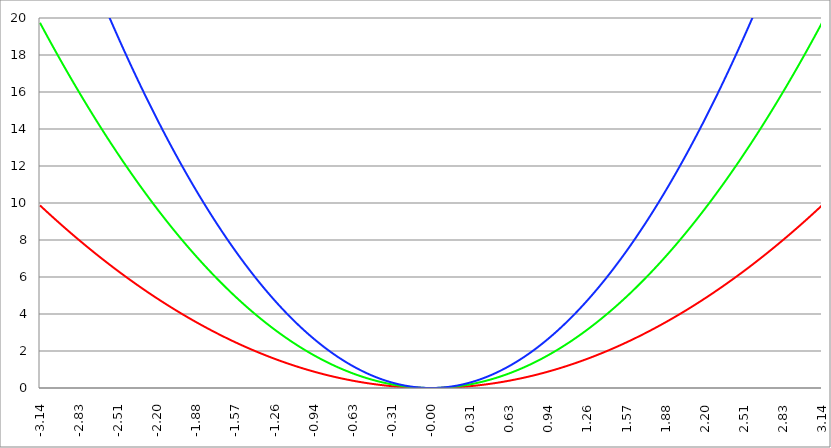
| Category | Series 1 | Series 0 | Series 2 |
|---|---|---|---|
| -3.141592653589793 | 9.87 | 19.739 | 29.609 |
| -3.138451060936204 | 9.85 | 19.7 | 29.55 |
| -3.135309468282614 | 9.83 | 19.66 | 29.49 |
| -3.132167875629024 | 9.81 | 19.621 | 29.431 |
| -3.129026282975434 | 9.791 | 19.582 | 29.372 |
| -3.125884690321845 | 9.771 | 19.542 | 29.313 |
| -3.122743097668256 | 9.752 | 19.503 | 29.255 |
| -3.119601505014666 | 9.732 | 19.464 | 29.196 |
| -3.116459912361076 | 9.712 | 19.425 | 29.137 |
| -3.113318319707487 | 9.693 | 19.386 | 29.078 |
| -3.110176727053897 | 9.673 | 19.346 | 29.02 |
| -3.107035134400308 | 9.654 | 19.307 | 28.961 |
| -3.103893541746717 | 9.634 | 19.268 | 28.902 |
| -3.100751949093128 | 9.615 | 19.229 | 28.844 |
| -3.097610356439539 | 9.595 | 19.19 | 28.786 |
| -3.094468763785949 | 9.576 | 19.151 | 28.727 |
| -3.09132717113236 | 9.556 | 19.113 | 28.669 |
| -3.08818557847877 | 9.537 | 19.074 | 28.611 |
| -3.08504398582518 | 9.517 | 19.035 | 28.552 |
| -3.081902393171591 | 9.498 | 18.996 | 28.494 |
| -3.078760800518001 | 9.479 | 18.958 | 28.436 |
| -3.075619207864412 | 9.459 | 18.919 | 28.378 |
| -3.072477615210822 | 9.44 | 18.88 | 28.32 |
| -3.069336022557232 | 9.421 | 18.842 | 28.262 |
| -3.066194429903643 | 9.402 | 18.803 | 28.205 |
| -3.063052837250053 | 9.382 | 18.765 | 28.147 |
| -3.059911244596463 | 9.363 | 18.726 | 28.089 |
| -3.056769651942874 | 9.344 | 18.688 | 28.032 |
| -3.053628059289284 | 9.325 | 18.649 | 27.974 |
| -3.050486466635695 | 9.305 | 18.611 | 27.916 |
| -3.047344873982105 | 9.286 | 18.573 | 27.859 |
| -3.044203281328516 | 9.267 | 18.534 | 27.802 |
| -3.041061688674926 | 9.248 | 18.496 | 27.744 |
| -3.037920096021336 | 9.229 | 18.458 | 27.687 |
| -3.034778503367747 | 9.21 | 18.42 | 27.63 |
| -3.031636910714157 | 9.191 | 18.382 | 27.572 |
| -3.028495318060568 | 9.172 | 18.344 | 27.515 |
| -3.025353725406978 | 9.153 | 18.306 | 27.458 |
| -3.022212132753388 | 9.134 | 18.268 | 27.401 |
| -3.019070540099799 | 9.115 | 18.23 | 27.344 |
| -3.015928947446209 | 9.096 | 18.192 | 27.287 |
| -3.01278735479262 | 9.077 | 18.154 | 27.231 |
| -3.00964576213903 | 9.058 | 18.116 | 27.174 |
| -3.00650416948544 | 9.039 | 18.078 | 27.117 |
| -3.003362576831851 | 9.02 | 18.04 | 27.061 |
| -3.000220984178261 | 9.001 | 18.003 | 27.004 |
| -2.997079391524672 | 8.982 | 17.965 | 26.947 |
| -2.993937798871082 | 8.964 | 17.927 | 26.891 |
| -2.990796206217492 | 8.945 | 17.89 | 26.835 |
| -2.987654613563903 | 8.926 | 17.852 | 26.778 |
| -2.984513020910313 | 8.907 | 17.815 | 26.722 |
| -2.981371428256724 | 8.889 | 17.777 | 26.666 |
| -2.978229835603134 | 8.87 | 17.74 | 26.61 |
| -2.975088242949544 | 8.851 | 17.702 | 26.553 |
| -2.971946650295955 | 8.832 | 17.665 | 26.497 |
| -2.968805057642365 | 8.814 | 17.628 | 26.441 |
| -2.965663464988776 | 8.795 | 17.59 | 26.385 |
| -2.962521872335186 | 8.777 | 17.553 | 26.33 |
| -2.959380279681596 | 8.758 | 17.516 | 26.274 |
| -2.956238687028007 | 8.739 | 17.479 | 26.218 |
| -2.953097094374417 | 8.721 | 17.442 | 26.162 |
| -2.949955501720828 | 8.702 | 17.404 | 26.107 |
| -2.946813909067238 | 8.684 | 17.367 | 26.051 |
| -2.943672316413648 | 8.665 | 17.33 | 25.996 |
| -2.940530723760059 | 8.647 | 17.293 | 25.94 |
| -2.937389131106469 | 8.628 | 17.257 | 25.885 |
| -2.93424753845288 | 8.61 | 17.22 | 25.829 |
| -2.93110594579929 | 8.591 | 17.183 | 25.774 |
| -2.9279643531457 | 8.573 | 17.146 | 25.719 |
| -2.924822760492111 | 8.555 | 17.109 | 25.664 |
| -2.921681167838521 | 8.536 | 17.072 | 25.609 |
| -2.918539575184932 | 8.518 | 17.036 | 25.554 |
| -2.915397982531342 | 8.5 | 16.999 | 25.499 |
| -2.912256389877752 | 8.481 | 16.962 | 25.444 |
| -2.909114797224163 | 8.463 | 16.926 | 25.389 |
| -2.905973204570573 | 8.445 | 16.889 | 25.334 |
| -2.902831611916984 | 8.426 | 16.853 | 25.279 |
| -2.899690019263394 | 8.408 | 16.816 | 25.225 |
| -2.896548426609804 | 8.39 | 16.78 | 25.17 |
| -2.893406833956215 | 8.372 | 16.744 | 25.115 |
| -2.890265241302625 | 8.354 | 16.707 | 25.061 |
| -2.887123648649035 | 8.335 | 16.671 | 25.006 |
| -2.883982055995446 | 8.317 | 16.635 | 24.952 |
| -2.880840463341856 | 8.299 | 16.598 | 24.898 |
| -2.877698870688267 | 8.281 | 16.562 | 24.843 |
| -2.874557278034677 | 8.263 | 16.526 | 24.789 |
| -2.871415685381088 | 8.245 | 16.49 | 24.735 |
| -2.868274092727498 | 8.227 | 16.454 | 24.681 |
| -2.865132500073908 | 8.209 | 16.418 | 24.627 |
| -2.861990907420319 | 8.191 | 16.382 | 24.573 |
| -2.858849314766729 | 8.173 | 16.346 | 24.519 |
| -2.85570772211314 | 8.155 | 16.31 | 24.465 |
| -2.85256612945955 | 8.137 | 16.274 | 24.411 |
| -2.84942453680596 | 8.119 | 16.238 | 24.358 |
| -2.846282944152371 | 8.101 | 16.203 | 24.304 |
| -2.843141351498781 | 8.083 | 16.167 | 24.25 |
| -2.839999758845192 | 8.066 | 16.131 | 24.197 |
| -2.836858166191602 | 8.048 | 16.096 | 24.143 |
| -2.833716573538012 | 8.03 | 16.06 | 24.09 |
| -2.830574980884423 | 8.012 | 16.024 | 24.036 |
| -2.827433388230833 | 7.994 | 15.989 | 23.983 |
| -2.824291795577244 | 7.977 | 15.953 | 23.93 |
| -2.821150202923654 | 7.959 | 15.918 | 23.877 |
| -2.818008610270065 | 7.941 | 15.882 | 23.824 |
| -2.814867017616475 | 7.923 | 15.847 | 23.77 |
| -2.811725424962885 | 7.906 | 15.812 | 23.717 |
| -2.808583832309296 | 7.888 | 15.776 | 23.664 |
| -2.805442239655706 | 7.871 | 15.741 | 23.612 |
| -2.802300647002116 | 7.853 | 15.706 | 23.559 |
| -2.799159054348527 | 7.835 | 15.671 | 23.506 |
| -2.796017461694937 | 7.818 | 15.635 | 23.453 |
| -2.792875869041348 | 7.8 | 15.6 | 23.4 |
| -2.789734276387758 | 7.783 | 15.565 | 23.348 |
| -2.786592683734168 | 7.765 | 15.53 | 23.295 |
| -2.783451091080579 | 7.748 | 15.495 | 23.243 |
| -2.78030949842699 | 7.73 | 15.46 | 23.19 |
| -2.7771679057734 | 7.713 | 15.425 | 23.138 |
| -2.77402631311981 | 7.695 | 15.39 | 23.086 |
| -2.770884720466221 | 7.678 | 15.356 | 23.033 |
| -2.767743127812631 | 7.66 | 15.321 | 22.981 |
| -2.764601535159041 | 7.643 | 15.286 | 22.929 |
| -2.761459942505452 | 7.626 | 15.251 | 22.877 |
| -2.758318349851862 | 7.608 | 15.217 | 22.825 |
| -2.755176757198272 | 7.591 | 15.182 | 22.773 |
| -2.752035164544683 | 7.574 | 15.147 | 22.721 |
| -2.748893571891093 | 7.556 | 15.113 | 22.669 |
| -2.745751979237504 | 7.539 | 15.078 | 22.617 |
| -2.742610386583914 | 7.522 | 15.044 | 22.566 |
| -2.739468793930325 | 7.505 | 15.009 | 22.514 |
| -2.736327201276735 | 7.487 | 14.975 | 22.462 |
| -2.733185608623145 | 7.47 | 14.941 | 22.411 |
| -2.730044015969556 | 7.453 | 14.906 | 22.359 |
| -2.726902423315966 | 7.436 | 14.872 | 22.308 |
| -2.723760830662376 | 7.419 | 14.838 | 22.257 |
| -2.720619238008787 | 7.402 | 14.804 | 22.205 |
| -2.717477645355197 | 7.385 | 14.769 | 22.154 |
| -2.714336052701607 | 7.368 | 14.735 | 22.103 |
| -2.711194460048018 | 7.351 | 14.701 | 22.052 |
| -2.708052867394429 | 7.334 | 14.667 | 22.001 |
| -2.704911274740839 | 7.317 | 14.633 | 21.95 |
| -2.701769682087249 | 7.3 | 14.599 | 21.899 |
| -2.69862808943366 | 7.283 | 14.565 | 21.848 |
| -2.69548649678007 | 7.266 | 14.531 | 21.797 |
| -2.692344904126481 | 7.249 | 14.497 | 21.746 |
| -2.689203311472891 | 7.232 | 14.464 | 21.695 |
| -2.686061718819301 | 7.215 | 14.43 | 21.645 |
| -2.682920126165712 | 7.198 | 14.396 | 21.594 |
| -2.679778533512122 | 7.181 | 14.362 | 21.544 |
| -2.676636940858533 | 7.164 | 14.329 | 21.493 |
| -2.673495348204943 | 7.148 | 14.295 | 21.443 |
| -2.670353755551353 | 7.131 | 14.262 | 21.392 |
| -2.667212162897764 | 7.114 | 14.228 | 21.342 |
| -2.664070570244174 | 7.097 | 14.195 | 21.292 |
| -2.660928977590585 | 7.081 | 14.161 | 21.242 |
| -2.657787384936995 | 7.064 | 14.128 | 21.192 |
| -2.654645792283405 | 7.047 | 14.094 | 21.141 |
| -2.651504199629816 | 7.03 | 14.061 | 21.091 |
| -2.648362606976226 | 7.014 | 14.028 | 21.041 |
| -2.645221014322636 | 6.997 | 13.994 | 20.992 |
| -2.642079421669047 | 6.981 | 13.961 | 20.942 |
| -2.638937829015457 | 6.964 | 13.928 | 20.892 |
| -2.635796236361868 | 6.947 | 13.895 | 20.842 |
| -2.632654643708278 | 6.931 | 13.862 | 20.793 |
| -2.629513051054689 | 6.914 | 13.829 | 20.743 |
| -2.626371458401099 | 6.898 | 13.796 | 20.693 |
| -2.62322986574751 | 6.881 | 13.763 | 20.644 |
| -2.62008827309392 | 6.865 | 13.73 | 20.595 |
| -2.61694668044033 | 6.848 | 13.697 | 20.545 |
| -2.613805087786741 | 6.832 | 13.664 | 20.496 |
| -2.610663495133151 | 6.816 | 13.631 | 20.447 |
| -2.607521902479561 | 6.799 | 13.598 | 20.398 |
| -2.604380309825972 | 6.783 | 13.566 | 20.348 |
| -2.601238717172382 | 6.766 | 13.533 | 20.299 |
| -2.598097124518793 | 6.75 | 13.5 | 20.25 |
| -2.594955531865203 | 6.734 | 13.468 | 20.201 |
| -2.591813939211613 | 6.717 | 13.435 | 20.152 |
| -2.588672346558024 | 6.701 | 13.402 | 20.104 |
| -2.585530753904434 | 6.685 | 13.37 | 20.055 |
| -2.582389161250845 | 6.669 | 13.337 | 20.006 |
| -2.579247568597255 | 6.653 | 13.305 | 19.958 |
| -2.576105975943666 | 6.636 | 13.273 | 19.909 |
| -2.572964383290076 | 6.62 | 13.24 | 19.86 |
| -2.569822790636486 | 6.604 | 13.208 | 19.812 |
| -2.566681197982897 | 6.588 | 13.176 | 19.764 |
| -2.563539605329307 | 6.572 | 13.143 | 19.715 |
| -2.560398012675717 | 6.556 | 13.111 | 19.667 |
| -2.557256420022128 | 6.54 | 13.079 | 19.619 |
| -2.554114827368538 | 6.524 | 13.047 | 19.571 |
| -2.550973234714949 | 6.507 | 13.015 | 19.522 |
| -2.54783164206136 | 6.491 | 12.983 | 19.474 |
| -2.54469004940777 | 6.475 | 12.951 | 19.426 |
| -2.54154845675418 | 6.459 | 12.919 | 19.378 |
| -2.53840686410059 | 6.444 | 12.887 | 19.331 |
| -2.535265271447001 | 6.428 | 12.855 | 19.283 |
| -2.532123678793411 | 6.412 | 12.823 | 19.235 |
| -2.528982086139822 | 6.396 | 12.792 | 19.187 |
| -2.525840493486232 | 6.38 | 12.76 | 19.14 |
| -2.522698900832642 | 6.364 | 12.728 | 19.092 |
| -2.519557308179053 | 6.348 | 12.696 | 19.045 |
| -2.516415715525463 | 6.332 | 12.665 | 18.997 |
| -2.513274122871874 | 6.317 | 12.633 | 18.95 |
| -2.510132530218284 | 6.301 | 12.602 | 18.902 |
| -2.506990937564694 | 6.285 | 12.57 | 18.855 |
| -2.503849344911105 | 6.269 | 12.539 | 18.808 |
| -2.500707752257515 | 6.254 | 12.507 | 18.761 |
| -2.497566159603926 | 6.238 | 12.476 | 18.714 |
| -2.494424566950336 | 6.222 | 12.444 | 18.666 |
| -2.491282974296746 | 6.206 | 12.413 | 18.619 |
| -2.488141381643157 | 6.191 | 12.382 | 18.573 |
| -2.484999788989567 | 6.175 | 12.35 | 18.526 |
| -2.481858196335978 | 6.16 | 12.319 | 18.479 |
| -2.478716603682388 | 6.144 | 12.288 | 18.432 |
| -2.475575011028798 | 6.128 | 12.257 | 18.385 |
| -2.472433418375209 | 6.113 | 12.226 | 18.339 |
| -2.46929182572162 | 6.097 | 12.195 | 18.292 |
| -2.46615023306803 | 6.082 | 12.164 | 18.246 |
| -2.46300864041444 | 6.066 | 12.133 | 18.199 |
| -2.45986704776085 | 6.051 | 12.102 | 18.153 |
| -2.456725455107261 | 6.035 | 12.071 | 18.106 |
| -2.453583862453671 | 6.02 | 12.04 | 18.06 |
| -2.450442269800082 | 6.005 | 12.009 | 18.014 |
| -2.447300677146492 | 5.989 | 11.979 | 17.968 |
| -2.444159084492902 | 5.974 | 11.948 | 17.922 |
| -2.441017491839313 | 5.959 | 11.917 | 17.876 |
| -2.437875899185723 | 5.943 | 11.886 | 17.83 |
| -2.434734306532133 | 5.928 | 11.856 | 17.784 |
| -2.431592713878544 | 5.913 | 11.825 | 17.738 |
| -2.428451121224954 | 5.897 | 11.795 | 17.692 |
| -2.425309528571365 | 5.882 | 11.764 | 17.646 |
| -2.422167935917775 | 5.867 | 11.734 | 17.601 |
| -2.419026343264186 | 5.852 | 11.703 | 17.555 |
| -2.415884750610596 | 5.836 | 11.673 | 17.509 |
| -2.412743157957006 | 5.821 | 11.643 | 17.464 |
| -2.409601565303417 | 5.806 | 11.612 | 17.419 |
| -2.406459972649827 | 5.791 | 11.582 | 17.373 |
| -2.403318379996238 | 5.776 | 11.552 | 17.328 |
| -2.400176787342648 | 5.761 | 11.522 | 17.283 |
| -2.397035194689058 | 5.746 | 11.492 | 17.237 |
| -2.393893602035469 | 5.731 | 11.461 | 17.192 |
| -2.390752009381879 | 5.716 | 11.431 | 17.147 |
| -2.38761041672829 | 5.701 | 11.401 | 17.102 |
| -2.3844688240747 | 5.686 | 11.371 | 17.057 |
| -2.38132723142111 | 5.671 | 11.341 | 17.012 |
| -2.378185638767521 | 5.656 | 11.312 | 16.967 |
| -2.375044046113931 | 5.641 | 11.282 | 16.923 |
| -2.371902453460342 | 5.626 | 11.252 | 16.878 |
| -2.368760860806752 | 5.611 | 11.222 | 16.833 |
| -2.365619268153162 | 5.596 | 11.192 | 16.788 |
| -2.362477675499573 | 5.581 | 11.163 | 16.744 |
| -2.359336082845983 | 5.566 | 11.133 | 16.699 |
| -2.356194490192394 | 5.552 | 11.103 | 16.655 |
| -2.353052897538804 | 5.537 | 11.074 | 16.611 |
| -2.349911304885214 | 5.522 | 11.044 | 16.566 |
| -2.346769712231625 | 5.507 | 11.015 | 16.522 |
| -2.343628119578035 | 5.493 | 10.985 | 16.478 |
| -2.340486526924446 | 5.478 | 10.956 | 16.434 |
| -2.337344934270856 | 5.463 | 10.926 | 16.39 |
| -2.334203341617266 | 5.449 | 10.897 | 16.346 |
| -2.331061748963677 | 5.434 | 10.868 | 16.302 |
| -2.327920156310087 | 5.419 | 10.838 | 16.258 |
| -2.324778563656498 | 5.405 | 10.809 | 16.214 |
| -2.321636971002908 | 5.39 | 10.78 | 16.17 |
| -2.318495378349318 | 5.375 | 10.751 | 16.126 |
| -2.315353785695729 | 5.361 | 10.722 | 16.083 |
| -2.312212193042139 | 5.346 | 10.693 | 16.039 |
| -2.30907060038855 | 5.332 | 10.664 | 15.995 |
| -2.30592900773496 | 5.317 | 10.635 | 15.952 |
| -2.30278741508137 | 5.303 | 10.606 | 15.908 |
| -2.299645822427781 | 5.288 | 10.577 | 15.865 |
| -2.296504229774191 | 5.274 | 10.548 | 15.822 |
| -2.293362637120602 | 5.26 | 10.519 | 15.779 |
| -2.290221044467012 | 5.245 | 10.49 | 15.735 |
| -2.287079451813422 | 5.231 | 10.461 | 15.692 |
| -2.283937859159832 | 5.216 | 10.433 | 15.649 |
| -2.280796266506243 | 5.202 | 10.404 | 15.606 |
| -2.277654673852654 | 5.188 | 10.375 | 15.563 |
| -2.274513081199064 | 5.173 | 10.347 | 15.52 |
| -2.271371488545474 | 5.159 | 10.318 | 15.477 |
| -2.268229895891885 | 5.145 | 10.29 | 15.435 |
| -2.265088303238295 | 5.131 | 10.261 | 15.392 |
| -2.261946710584706 | 5.116 | 10.233 | 15.349 |
| -2.258805117931116 | 5.102 | 10.204 | 15.307 |
| -2.255663525277527 | 5.088 | 10.176 | 15.264 |
| -2.252521932623937 | 5.074 | 10.148 | 15.222 |
| -2.249380339970347 | 5.06 | 10.119 | 15.179 |
| -2.246238747316757 | 5.046 | 10.091 | 15.137 |
| -2.243097154663168 | 5.031 | 10.063 | 15.094 |
| -2.239955562009579 | 5.017 | 10.035 | 15.052 |
| -2.236813969355989 | 5.003 | 10.007 | 15.01 |
| -2.2336723767024 | 4.989 | 9.979 | 14.968 |
| -2.23053078404881 | 4.975 | 9.951 | 14.926 |
| -2.22738919139522 | 4.961 | 9.923 | 14.884 |
| -2.22424759874163 | 4.947 | 9.895 | 14.842 |
| -2.221106006088041 | 4.933 | 9.867 | 14.8 |
| -2.217964413434451 | 4.919 | 9.839 | 14.758 |
| -2.214822820780862 | 4.905 | 9.811 | 14.716 |
| -2.211681228127272 | 4.892 | 9.783 | 14.675 |
| -2.208539635473683 | 4.878 | 9.755 | 14.633 |
| -2.205398042820092 | 4.864 | 9.728 | 14.591 |
| -2.202256450166503 | 4.85 | 9.7 | 14.55 |
| -2.199114857512913 | 4.836 | 9.672 | 14.508 |
| -2.195973264859324 | 4.822 | 9.645 | 14.467 |
| -2.192831672205735 | 4.809 | 9.617 | 14.426 |
| -2.189690079552145 | 4.795 | 9.589 | 14.384 |
| -2.186548486898555 | 4.781 | 9.562 | 14.343 |
| -2.183406894244966 | 4.767 | 9.535 | 14.302 |
| -2.180265301591376 | 4.754 | 9.507 | 14.261 |
| -2.177123708937786 | 4.74 | 9.48 | 14.22 |
| -2.173982116284197 | 4.726 | 9.452 | 14.179 |
| -2.170840523630607 | 4.713 | 9.425 | 14.138 |
| -2.167698930977018 | 4.699 | 9.398 | 14.097 |
| -2.164557338323428 | 4.685 | 9.371 | 14.056 |
| -2.161415745669839 | 4.672 | 9.343 | 14.015 |
| -2.158274153016249 | 4.658 | 9.316 | 13.974 |
| -2.15513256036266 | 4.645 | 9.289 | 13.934 |
| -2.15199096770907 | 4.631 | 9.262 | 13.893 |
| -2.14884937505548 | 4.618 | 9.235 | 13.853 |
| -2.14570778240189 | 4.604 | 9.208 | 13.812 |
| -2.142566189748301 | 4.591 | 9.181 | 13.772 |
| -2.139424597094711 | 4.577 | 9.154 | 13.731 |
| -2.136283004441122 | 4.564 | 9.127 | 13.691 |
| -2.133141411787532 | 4.55 | 9.101 | 13.651 |
| -2.129999819133943 | 4.537 | 9.074 | 13.611 |
| -2.126858226480353 | 4.524 | 9.047 | 13.571 |
| -2.123716633826763 | 4.51 | 9.02 | 13.531 |
| -2.120575041173174 | 4.497 | 8.994 | 13.491 |
| -2.117433448519584 | 4.484 | 8.967 | 13.451 |
| -2.114291855865994 | 4.47 | 8.94 | 13.411 |
| -2.111150263212405 | 4.457 | 8.914 | 13.371 |
| -2.108008670558815 | 4.444 | 8.887 | 13.331 |
| -2.104867077905226 | 4.43 | 8.861 | 13.291 |
| -2.101725485251636 | 4.417 | 8.835 | 13.252 |
| -2.098583892598047 | 4.404 | 8.808 | 13.212 |
| -2.095442299944457 | 4.391 | 8.782 | 13.173 |
| -2.092300707290867 | 4.378 | 8.755 | 13.133 |
| -2.089159114637278 | 4.365 | 8.729 | 13.094 |
| -2.086017521983688 | 4.351 | 8.703 | 13.054 |
| -2.082875929330099 | 4.338 | 8.677 | 13.015 |
| -2.07973433667651 | 4.325 | 8.651 | 12.976 |
| -2.07659274402292 | 4.312 | 8.624 | 12.937 |
| -2.07345115136933 | 4.299 | 8.598 | 12.898 |
| -2.07030955871574 | 4.286 | 8.572 | 12.859 |
| -2.06716796606215 | 4.273 | 8.546 | 12.82 |
| -2.064026373408561 | 4.26 | 8.52 | 12.781 |
| -2.060884780754971 | 4.247 | 8.494 | 12.742 |
| -2.057743188101382 | 4.234 | 8.469 | 12.703 |
| -2.054601595447792 | 4.221 | 8.443 | 12.664 |
| -2.051460002794203 | 4.208 | 8.417 | 12.625 |
| -2.048318410140613 | 4.196 | 8.391 | 12.587 |
| -2.045176817487023 | 4.183 | 8.365 | 12.548 |
| -2.042035224833434 | 4.17 | 8.34 | 12.51 |
| -2.038893632179844 | 4.157 | 8.314 | 12.471 |
| -2.035752039526255 | 4.144 | 8.289 | 12.433 |
| -2.032610446872665 | 4.132 | 8.263 | 12.395 |
| -2.029468854219076 | 4.119 | 8.237 | 12.356 |
| -2.026327261565486 | 4.106 | 8.212 | 12.318 |
| -2.023185668911896 | 4.093 | 8.187 | 12.28 |
| -2.020044076258307 | 4.081 | 8.161 | 12.242 |
| -2.016902483604717 | 4.068 | 8.136 | 12.204 |
| -2.013760890951128 | 4.055 | 8.11 | 12.166 |
| -2.010619298297538 | 4.043 | 8.085 | 12.128 |
| -2.007477705643948 | 4.03 | 8.06 | 12.09 |
| -2.004336112990358 | 4.017 | 8.035 | 12.052 |
| -2.00119452033677 | 4.005 | 8.01 | 12.014 |
| -1.99805292768318 | 3.992 | 7.984 | 11.977 |
| -1.994911335029589 | 3.98 | 7.959 | 11.939 |
| -1.991769742376 | 3.967 | 7.934 | 11.901 |
| -1.98862814972241 | 3.955 | 7.909 | 11.864 |
| -1.98548655706882 | 3.942 | 7.884 | 11.826 |
| -1.98234496441523 | 3.93 | 7.859 | 11.789 |
| -1.97920337176164 | 3.917 | 7.834 | 11.752 |
| -1.976061779108051 | 3.905 | 7.81 | 11.714 |
| -1.972920186454461 | 3.892 | 7.785 | 11.677 |
| -1.969778593800871 | 3.88 | 7.76 | 11.64 |
| -1.966637001147281 | 3.868 | 7.735 | 11.603 |
| -1.963495408493691 | 3.855 | 7.711 | 11.566 |
| -1.960353815840101 | 3.843 | 7.686 | 11.529 |
| -1.957212223186512 | 3.831 | 7.661 | 11.492 |
| -1.954070630532922 | 3.818 | 7.637 | 11.455 |
| -1.950929037879332 | 3.806 | 7.612 | 11.418 |
| -1.947787445225742 | 3.794 | 7.588 | 11.382 |
| -1.944645852572152 | 3.782 | 7.563 | 11.345 |
| -1.941504259918563 | 3.769 | 7.539 | 11.308 |
| -1.938362667264973 | 3.757 | 7.514 | 11.272 |
| -1.935221074611383 | 3.745 | 7.49 | 11.235 |
| -1.932079481957793 | 3.733 | 7.466 | 11.199 |
| -1.928937889304203 | 3.721 | 7.442 | 11.162 |
| -1.925796296650613 | 3.709 | 7.417 | 11.126 |
| -1.922654703997024 | 3.697 | 7.393 | 11.09 |
| -1.919513111343434 | 3.685 | 7.369 | 11.054 |
| -1.916371518689844 | 3.672 | 7.345 | 11.017 |
| -1.913229926036254 | 3.66 | 7.321 | 10.981 |
| -1.910088333382664 | 3.648 | 7.297 | 10.945 |
| -1.906946740729075 | 3.636 | 7.273 | 10.909 |
| -1.903805148075485 | 3.624 | 7.249 | 10.873 |
| -1.900663555421895 | 3.613 | 7.225 | 10.838 |
| -1.897521962768305 | 3.601 | 7.201 | 10.802 |
| -1.894380370114715 | 3.589 | 7.177 | 10.766 |
| -1.891238777461125 | 3.577 | 7.154 | 10.73 |
| -1.888097184807536 | 3.565 | 7.13 | 10.695 |
| -1.884955592153946 | 3.553 | 7.106 | 10.659 |
| -1.881813999500356 | 3.541 | 7.082 | 10.624 |
| -1.878672406846766 | 3.529 | 7.059 | 10.588 |
| -1.875530814193176 | 3.518 | 7.035 | 10.553 |
| -1.872389221539586 | 3.506 | 7.012 | 10.518 |
| -1.869247628885997 | 3.494 | 6.988 | 10.482 |
| -1.866106036232407 | 3.482 | 6.965 | 10.447 |
| -1.862964443578817 | 3.471 | 6.941 | 10.412 |
| -1.859822850925227 | 3.459 | 6.918 | 10.377 |
| -1.856681258271637 | 3.447 | 6.895 | 10.342 |
| -1.853539665618048 | 3.436 | 6.871 | 10.307 |
| -1.850398072964458 | 3.424 | 6.848 | 10.272 |
| -1.847256480310868 | 3.412 | 6.825 | 10.237 |
| -1.844114887657278 | 3.401 | 6.802 | 10.202 |
| -1.840973295003688 | 3.389 | 6.778 | 10.168 |
| -1.837831702350098 | 3.378 | 6.755 | 10.133 |
| -1.834690109696509 | 3.366 | 6.732 | 10.098 |
| -1.831548517042919 | 3.355 | 6.709 | 10.064 |
| -1.82840692438933 | 3.343 | 6.686 | 10.029 |
| -1.82526533173574 | 3.332 | 6.663 | 9.995 |
| -1.822123739082149 | 3.32 | 6.64 | 9.96 |
| -1.81898214642856 | 3.309 | 6.617 | 9.926 |
| -1.81584055377497 | 3.297 | 6.595 | 9.892 |
| -1.81269896112138 | 3.286 | 6.572 | 9.858 |
| -1.80955736846779 | 3.274 | 6.549 | 9.823 |
| -1.8064157758142 | 3.263 | 6.526 | 9.789 |
| -1.80327418316061 | 3.252 | 6.504 | 9.755 |
| -1.800132590507021 | 3.24 | 6.481 | 9.721 |
| -1.796990997853431 | 3.229 | 6.458 | 9.688 |
| -1.793849405199841 | 3.218 | 6.436 | 9.654 |
| -1.790707812546251 | 3.207 | 6.413 | 9.62 |
| -1.787566219892661 | 3.195 | 6.391 | 9.586 |
| -1.784424627239071 | 3.184 | 6.368 | 9.553 |
| -1.781283034585482 | 3.173 | 6.346 | 9.519 |
| -1.778141441931892 | 3.162 | 6.324 | 9.485 |
| -1.774999849278302 | 3.151 | 6.301 | 9.452 |
| -1.771858256624712 | 3.139 | 6.279 | 9.418 |
| -1.768716663971122 | 3.128 | 6.257 | 9.385 |
| -1.765575071317533 | 3.117 | 6.235 | 9.352 |
| -1.762433478663943 | 3.106 | 6.212 | 9.319 |
| -1.759291886010353 | 3.095 | 6.19 | 9.285 |
| -1.756150293356763 | 3.084 | 6.168 | 9.252 |
| -1.753008700703173 | 3.073 | 6.146 | 9.219 |
| -1.749867108049583 | 3.062 | 6.124 | 9.186 |
| -1.746725515395994 | 3.051 | 6.102 | 9.153 |
| -1.743583922742404 | 3.04 | 6.08 | 9.12 |
| -1.740442330088814 | 3.029 | 6.058 | 9.087 |
| -1.737300737435224 | 3.018 | 6.036 | 9.055 |
| -1.734159144781634 | 3.007 | 6.015 | 9.022 |
| -1.731017552128045 | 2.996 | 5.993 | 8.989 |
| -1.727875959474455 | 2.986 | 5.971 | 8.957 |
| -1.724734366820865 | 2.975 | 5.949 | 8.924 |
| -1.721592774167275 | 2.964 | 5.928 | 8.892 |
| -1.718451181513685 | 2.953 | 5.906 | 8.859 |
| -1.715309588860095 | 2.942 | 5.885 | 8.827 |
| -1.712167996206506 | 2.932 | 5.863 | 8.795 |
| -1.709026403552916 | 2.921 | 5.842 | 8.762 |
| -1.705884810899326 | 2.91 | 5.82 | 8.73 |
| -1.702743218245736 | 2.899 | 5.799 | 8.698 |
| -1.699601625592146 | 2.889 | 5.777 | 8.666 |
| -1.696460032938557 | 2.878 | 5.756 | 8.634 |
| -1.693318440284967 | 2.867 | 5.735 | 8.602 |
| -1.690176847631377 | 2.857 | 5.713 | 8.57 |
| -1.687035254977787 | 2.846 | 5.692 | 8.538 |
| -1.683893662324197 | 2.835 | 5.671 | 8.506 |
| -1.680752069670607 | 2.825 | 5.65 | 8.475 |
| -1.677610477017018 | 2.814 | 5.629 | 8.443 |
| -1.674468884363428 | 2.804 | 5.608 | 8.412 |
| -1.671327291709838 | 2.793 | 5.587 | 8.38 |
| -1.668185699056248 | 2.783 | 5.566 | 8.349 |
| -1.665044106402658 | 2.772 | 5.545 | 8.317 |
| -1.661902513749069 | 2.762 | 5.524 | 8.286 |
| -1.658760921095479 | 2.751 | 5.503 | 8.254 |
| -1.655619328441889 | 2.741 | 5.482 | 8.223 |
| -1.6524777357883 | 2.731 | 5.461 | 8.192 |
| -1.649336143134709 | 2.72 | 5.441 | 8.161 |
| -1.646194550481119 | 2.71 | 5.42 | 8.13 |
| -1.64305295782753 | 2.7 | 5.399 | 8.099 |
| -1.63991136517394 | 2.689 | 5.379 | 8.068 |
| -1.63676977252035 | 2.679 | 5.358 | 8.037 |
| -1.63362817986676 | 2.669 | 5.337 | 8.006 |
| -1.63048658721317 | 2.658 | 5.317 | 7.975 |
| -1.62734499455958 | 2.648 | 5.297 | 7.945 |
| -1.624203401905991 | 2.638 | 5.276 | 7.914 |
| -1.621061809252401 | 2.628 | 5.256 | 7.884 |
| -1.617920216598811 | 2.618 | 5.235 | 7.853 |
| -1.614778623945221 | 2.608 | 5.215 | 7.823 |
| -1.611637031291631 | 2.597 | 5.195 | 7.792 |
| -1.608495438638042 | 2.587 | 5.175 | 7.762 |
| -1.605353845984452 | 2.577 | 5.154 | 7.731 |
| -1.602212253330862 | 2.567 | 5.134 | 7.701 |
| -1.599070660677272 | 2.557 | 5.114 | 7.671 |
| -1.595929068023682 | 2.547 | 5.094 | 7.641 |
| -1.592787475370093 | 2.537 | 5.074 | 7.611 |
| -1.589645882716503 | 2.527 | 5.054 | 7.581 |
| -1.586504290062913 | 2.517 | 5.034 | 7.551 |
| -1.583362697409323 | 2.507 | 5.014 | 7.521 |
| -1.580221104755733 | 2.497 | 4.994 | 7.491 |
| -1.577079512102143 | 2.487 | 4.974 | 7.462 |
| -1.573937919448554 | 2.477 | 4.955 | 7.432 |
| -1.570796326794964 | 2.467 | 4.935 | 7.402 |
| -1.567654734141374 | 2.458 | 4.915 | 7.373 |
| -1.564513141487784 | 2.448 | 4.895 | 7.343 |
| -1.561371548834194 | 2.438 | 4.876 | 7.314 |
| -1.558229956180605 | 2.428 | 4.856 | 7.284 |
| -1.555088363527015 | 2.418 | 4.837 | 7.255 |
| -1.551946770873425 | 2.409 | 4.817 | 7.226 |
| -1.548805178219835 | 2.399 | 4.798 | 7.196 |
| -1.545663585566245 | 2.389 | 4.778 | 7.167 |
| -1.542521992912655 | 2.379 | 4.759 | 7.138 |
| -1.539380400259066 | 2.37 | 4.739 | 7.109 |
| -1.536238807605476 | 2.36 | 4.72 | 7.08 |
| -1.533097214951886 | 2.35 | 4.701 | 7.051 |
| -1.529955622298296 | 2.341 | 4.682 | 7.022 |
| -1.526814029644706 | 2.331 | 4.662 | 6.993 |
| -1.523672436991117 | 2.322 | 4.643 | 6.965 |
| -1.520530844337527 | 2.312 | 4.624 | 6.936 |
| -1.517389251683937 | 2.302 | 4.605 | 6.907 |
| -1.514247659030347 | 2.293 | 4.586 | 6.879 |
| -1.511106066376757 | 2.283 | 4.567 | 6.85 |
| -1.507964473723167 | 2.274 | 4.548 | 6.822 |
| -1.504822881069578 | 2.264 | 4.529 | 6.793 |
| -1.501681288415988 | 2.255 | 4.51 | 6.765 |
| -1.498539695762398 | 2.246 | 4.491 | 6.737 |
| -1.495398103108808 | 2.236 | 4.472 | 6.709 |
| -1.492256510455218 | 2.227 | 4.454 | 6.68 |
| -1.489114917801628 | 2.217 | 4.435 | 6.652 |
| -1.485973325148039 | 2.208 | 4.416 | 6.624 |
| -1.482831732494449 | 2.199 | 4.398 | 6.596 |
| -1.47969013984086 | 2.189 | 4.379 | 6.568 |
| -1.476548547187269 | 2.18 | 4.36 | 6.541 |
| -1.473406954533679 | 2.171 | 4.342 | 6.513 |
| -1.47026536188009 | 2.162 | 4.323 | 6.485 |
| -1.4671237692265 | 2.152 | 4.305 | 6.457 |
| -1.46398217657291 | 2.143 | 4.286 | 6.43 |
| -1.46084058391932 | 2.134 | 4.268 | 6.402 |
| -1.45769899126573 | 2.125 | 4.25 | 6.375 |
| -1.45455739861214 | 2.116 | 4.231 | 6.347 |
| -1.451415805958551 | 2.107 | 4.213 | 6.32 |
| -1.448274213304961 | 2.097 | 4.195 | 6.292 |
| -1.445132620651371 | 2.088 | 4.177 | 6.265 |
| -1.441991027997781 | 2.079 | 4.159 | 6.238 |
| -1.438849435344191 | 2.07 | 4.141 | 6.211 |
| -1.435707842690602 | 2.061 | 4.123 | 6.184 |
| -1.432566250037012 | 2.052 | 4.104 | 6.157 |
| -1.429424657383422 | 2.043 | 4.087 | 6.13 |
| -1.426283064729832 | 2.034 | 4.069 | 6.103 |
| -1.423141472076242 | 2.025 | 4.051 | 6.076 |
| -1.419999879422652 | 2.016 | 4.033 | 6.049 |
| -1.416858286769063 | 2.007 | 4.015 | 6.022 |
| -1.413716694115473 | 1.999 | 3.997 | 5.996 |
| -1.410575101461883 | 1.99 | 3.979 | 5.969 |
| -1.407433508808293 | 1.981 | 3.962 | 5.943 |
| -1.404291916154703 | 1.972 | 3.944 | 5.916 |
| -1.401150323501114 | 1.963 | 3.926 | 5.89 |
| -1.398008730847524 | 1.954 | 3.909 | 5.863 |
| -1.394867138193934 | 1.946 | 3.891 | 5.837 |
| -1.391725545540344 | 1.937 | 3.874 | 5.811 |
| -1.388583952886754 | 1.928 | 3.856 | 5.784 |
| -1.385442360233164 | 1.919 | 3.839 | 5.758 |
| -1.382300767579575 | 1.911 | 3.822 | 5.732 |
| -1.379159174925985 | 1.902 | 3.804 | 5.706 |
| -1.376017582272395 | 1.893 | 3.787 | 5.68 |
| -1.372875989618805 | 1.885 | 3.77 | 5.654 |
| -1.369734396965215 | 1.876 | 3.752 | 5.629 |
| -1.366592804311625 | 1.868 | 3.735 | 5.603 |
| -1.363451211658036 | 1.859 | 3.718 | 5.577 |
| -1.360309619004446 | 1.85 | 3.701 | 5.551 |
| -1.357168026350856 | 1.842 | 3.684 | 5.526 |
| -1.354026433697266 | 1.833 | 3.667 | 5.5 |
| -1.350884841043676 | 1.825 | 3.65 | 5.475 |
| -1.347743248390087 | 1.816 | 3.633 | 5.449 |
| -1.344601655736497 | 1.808 | 3.616 | 5.424 |
| -1.341460063082907 | 1.8 | 3.599 | 5.399 |
| -1.338318470429317 | 1.791 | 3.582 | 5.373 |
| -1.335176877775727 | 1.783 | 3.565 | 5.348 |
| -1.332035285122137 | 1.774 | 3.549 | 5.323 |
| -1.328893692468548 | 1.766 | 3.532 | 5.298 |
| -1.325752099814958 | 1.758 | 3.515 | 5.273 |
| -1.322610507161368 | 1.749 | 3.499 | 5.248 |
| -1.319468914507778 | 1.741 | 3.482 | 5.223 |
| -1.316327321854188 | 1.733 | 3.465 | 5.198 |
| -1.313185729200599 | 1.724 | 3.449 | 5.173 |
| -1.310044136547009 | 1.716 | 3.432 | 5.149 |
| -1.306902543893419 | 1.708 | 3.416 | 5.124 |
| -1.303760951239829 | 1.7 | 3.4 | 5.099 |
| -1.300619358586239 | 1.692 | 3.383 | 5.075 |
| -1.297477765932649 | 1.683 | 3.367 | 5.05 |
| -1.29433617327906 | 1.675 | 3.351 | 5.026 |
| -1.29119458062547 | 1.667 | 3.334 | 5.002 |
| -1.28805298797188 | 1.659 | 3.318 | 4.977 |
| -1.28491139531829 | 1.651 | 3.302 | 4.953 |
| -1.2817698026647 | 1.643 | 3.286 | 4.929 |
| -1.278628210011111 | 1.635 | 3.27 | 4.905 |
| -1.275486617357521 | 1.627 | 3.254 | 4.881 |
| -1.272345024703931 | 1.619 | 3.238 | 4.857 |
| -1.269203432050341 | 1.611 | 3.222 | 4.833 |
| -1.266061839396751 | 1.603 | 3.206 | 4.809 |
| -1.262920246743161 | 1.595 | 3.19 | 4.785 |
| -1.259778654089572 | 1.587 | 3.174 | 4.761 |
| -1.256637061435982 | 1.579 | 3.158 | 4.737 |
| -1.253495468782392 | 1.571 | 3.143 | 4.714 |
| -1.250353876128802 | 1.563 | 3.127 | 4.69 |
| -1.247212283475212 | 1.556 | 3.111 | 4.667 |
| -1.244070690821623 | 1.548 | 3.095 | 4.643 |
| -1.240929098168033 | 1.54 | 3.08 | 4.62 |
| -1.237787505514443 | 1.532 | 3.064 | 4.596 |
| -1.234645912860853 | 1.524 | 3.049 | 4.573 |
| -1.231504320207263 | 1.517 | 3.033 | 4.55 |
| -1.228362727553673 | 1.509 | 3.018 | 4.527 |
| -1.225221134900084 | 1.501 | 3.002 | 4.504 |
| -1.222079542246494 | 1.493 | 2.987 | 4.48 |
| -1.218937949592904 | 1.486 | 2.972 | 4.457 |
| -1.215796356939314 | 1.478 | 2.956 | 4.434 |
| -1.212654764285724 | 1.471 | 2.941 | 4.412 |
| -1.209513171632135 | 1.463 | 2.926 | 4.389 |
| -1.206371578978545 | 1.455 | 2.911 | 4.366 |
| -1.203229986324955 | 1.448 | 2.896 | 4.343 |
| -1.200088393671365 | 1.44 | 2.88 | 4.321 |
| -1.196946801017775 | 1.433 | 2.865 | 4.298 |
| -1.193805208364185 | 1.425 | 2.85 | 4.276 |
| -1.190663615710596 | 1.418 | 2.835 | 4.253 |
| -1.187522023057006 | 1.41 | 2.82 | 4.231 |
| -1.184380430403416 | 1.403 | 2.806 | 4.208 |
| -1.181238837749826 | 1.395 | 2.791 | 4.186 |
| -1.178097245096236 | 1.388 | 2.776 | 4.164 |
| -1.174955652442647 | 1.381 | 2.761 | 4.142 |
| -1.171814059789057 | 1.373 | 2.746 | 4.119 |
| -1.168672467135467 | 1.366 | 2.732 | 4.097 |
| -1.165530874481877 | 1.358 | 2.717 | 4.075 |
| -1.162389281828287 | 1.351 | 2.702 | 4.053 |
| -1.159247689174697 | 1.344 | 2.688 | 4.032 |
| -1.156106096521108 | 1.337 | 2.673 | 4.01 |
| -1.152964503867518 | 1.329 | 2.659 | 3.988 |
| -1.149822911213928 | 1.322 | 2.644 | 3.966 |
| -1.146681318560338 | 1.315 | 2.63 | 3.945 |
| -1.143539725906748 | 1.308 | 2.615 | 3.923 |
| -1.140398133253159 | 1.301 | 2.601 | 3.902 |
| -1.137256540599569 | 1.293 | 2.587 | 3.88 |
| -1.134114947945979 | 1.286 | 2.572 | 3.859 |
| -1.130973355292389 | 1.279 | 2.558 | 3.837 |
| -1.127831762638799 | 1.272 | 2.544 | 3.816 |
| -1.12469016998521 | 1.265 | 2.53 | 3.795 |
| -1.12154857733162 | 1.258 | 2.516 | 3.774 |
| -1.11840698467803 | 1.251 | 2.502 | 3.753 |
| -1.11526539202444 | 1.244 | 2.488 | 3.731 |
| -1.11212379937085 | 1.237 | 2.474 | 3.71 |
| -1.10898220671726 | 1.23 | 2.46 | 3.69 |
| -1.105840614063671 | 1.223 | 2.446 | 3.669 |
| -1.102699021410081 | 1.216 | 2.432 | 3.648 |
| -1.099557428756491 | 1.209 | 2.418 | 3.627 |
| -1.096415836102901 | 1.202 | 2.404 | 3.606 |
| -1.093274243449311 | 1.195 | 2.39 | 3.586 |
| -1.090132650795721 | 1.188 | 2.377 | 3.565 |
| -1.086991058142132 | 1.182 | 2.363 | 3.545 |
| -1.083849465488542 | 1.175 | 2.349 | 3.524 |
| -1.080707872834952 | 1.168 | 2.336 | 3.504 |
| -1.077566280181362 | 1.161 | 2.322 | 3.483 |
| -1.074424687527772 | 1.154 | 2.309 | 3.463 |
| -1.071283094874182 | 1.148 | 2.295 | 3.443 |
| -1.068141502220593 | 1.141 | 2.282 | 3.423 |
| -1.064999909567003 | 1.134 | 2.268 | 3.403 |
| -1.061858316913413 | 1.128 | 2.255 | 3.383 |
| -1.058716724259823 | 1.121 | 2.242 | 3.363 |
| -1.055575131606233 | 1.114 | 2.228 | 3.343 |
| -1.052433538952644 | 1.108 | 2.215 | 3.323 |
| -1.049291946299054 | 1.101 | 2.202 | 3.303 |
| -1.046150353645464 | 1.094 | 2.189 | 3.283 |
| -1.043008760991874 | 1.088 | 2.176 | 3.264 |
| -1.039867168338284 | 1.081 | 2.163 | 3.244 |
| -1.036725575684694 | 1.075 | 2.15 | 3.224 |
| -1.033583983031105 | 1.068 | 2.137 | 3.205 |
| -1.030442390377515 | 1.062 | 2.124 | 3.185 |
| -1.027300797723925 | 1.055 | 2.111 | 3.166 |
| -1.024159205070335 | 1.049 | 2.098 | 3.147 |
| -1.021017612416745 | 1.042 | 2.085 | 3.127 |
| -1.017876019763156 | 1.036 | 2.072 | 3.108 |
| -1.014734427109566 | 1.03 | 2.059 | 3.089 |
| -1.011592834455976 | 1.023 | 2.047 | 3.07 |
| -1.008451241802386 | 1.017 | 2.034 | 3.051 |
| -1.005309649148796 | 1.011 | 2.021 | 3.032 |
| -1.002168056495206 | 1.004 | 2.009 | 3.013 |
| -0.999026463841617 | 0.998 | 1.996 | 2.994 |
| -0.995884871188027 | 0.992 | 1.984 | 2.975 |
| -0.992743278534437 | 0.986 | 1.971 | 2.957 |
| -0.989601685880847 | 0.979 | 1.959 | 2.938 |
| -0.986460093227257 | 0.973 | 1.946 | 2.919 |
| -0.983318500573668 | 0.967 | 1.934 | 2.901 |
| -0.980176907920078 | 0.961 | 1.921 | 2.882 |
| -0.977035315266488 | 0.955 | 1.909 | 2.864 |
| -0.973893722612898 | 0.948 | 1.897 | 2.845 |
| -0.970752129959308 | 0.942 | 1.885 | 2.827 |
| -0.967610537305718 | 0.936 | 1.873 | 2.809 |
| -0.964468944652129 | 0.93 | 1.86 | 2.791 |
| -0.961327351998539 | 0.924 | 1.848 | 2.772 |
| -0.958185759344949 | 0.918 | 1.836 | 2.754 |
| -0.955044166691359 | 0.912 | 1.824 | 2.736 |
| -0.951902574037769 | 0.906 | 1.812 | 2.718 |
| -0.948760981384179 | 0.9 | 1.8 | 2.7 |
| -0.94561938873059 | 0.894 | 1.788 | 2.683 |
| -0.942477796077 | 0.888 | 1.777 | 2.665 |
| -0.93933620342341 | 0.882 | 1.765 | 2.647 |
| -0.93619461076982 | 0.876 | 1.753 | 2.629 |
| -0.93305301811623 | 0.871 | 1.741 | 2.612 |
| -0.929911425462641 | 0.865 | 1.729 | 2.594 |
| -0.926769832809051 | 0.859 | 1.718 | 2.577 |
| -0.923628240155461 | 0.853 | 1.706 | 2.559 |
| -0.920486647501871 | 0.847 | 1.695 | 2.542 |
| -0.917345054848281 | 0.842 | 1.683 | 2.525 |
| -0.914203462194691 | 0.836 | 1.672 | 2.507 |
| -0.911061869541102 | 0.83 | 1.66 | 2.49 |
| -0.907920276887512 | 0.824 | 1.649 | 2.473 |
| -0.904778684233922 | 0.819 | 1.637 | 2.456 |
| -0.901637091580332 | 0.813 | 1.626 | 2.439 |
| -0.898495498926742 | 0.807 | 1.615 | 2.422 |
| -0.895353906273153 | 0.802 | 1.603 | 2.405 |
| -0.892212313619563 | 0.796 | 1.592 | 2.388 |
| -0.889070720965973 | 0.79 | 1.581 | 2.371 |
| -0.885929128312383 | 0.785 | 1.57 | 2.355 |
| -0.882787535658793 | 0.779 | 1.559 | 2.338 |
| -0.879645943005203 | 0.774 | 1.548 | 2.321 |
| -0.876504350351614 | 0.768 | 1.537 | 2.305 |
| -0.873362757698024 | 0.763 | 1.526 | 2.288 |
| -0.870221165044434 | 0.757 | 1.515 | 2.272 |
| -0.867079572390844 | 0.752 | 1.504 | 2.255 |
| -0.863937979737254 | 0.746 | 1.493 | 2.239 |
| -0.860796387083665 | 0.741 | 1.482 | 2.223 |
| -0.857654794430075 | 0.736 | 1.471 | 2.207 |
| -0.854513201776485 | 0.73 | 1.46 | 2.191 |
| -0.851371609122895 | 0.725 | 1.45 | 2.175 |
| -0.848230016469305 | 0.719 | 1.439 | 2.158 |
| -0.845088423815715 | 0.714 | 1.428 | 2.143 |
| -0.841946831162126 | 0.709 | 1.418 | 2.127 |
| -0.838805238508536 | 0.704 | 1.407 | 2.111 |
| -0.835663645854946 | 0.698 | 1.397 | 2.095 |
| -0.832522053201356 | 0.693 | 1.386 | 2.079 |
| -0.829380460547766 | 0.688 | 1.376 | 2.064 |
| -0.826238867894177 | 0.683 | 1.365 | 2.048 |
| -0.823097275240587 | 0.677 | 1.355 | 2.032 |
| -0.819955682586997 | 0.672 | 1.345 | 2.017 |
| -0.816814089933407 | 0.667 | 1.334 | 2.002 |
| -0.813672497279817 | 0.662 | 1.324 | 1.986 |
| -0.810530904626227 | 0.657 | 1.314 | 1.971 |
| -0.807389311972638 | 0.652 | 1.304 | 1.956 |
| -0.804247719319048 | 0.647 | 1.294 | 1.94 |
| -0.801106126665458 | 0.642 | 1.284 | 1.925 |
| -0.797964534011868 | 0.637 | 1.273 | 1.91 |
| -0.794822941358278 | 0.632 | 1.263 | 1.895 |
| -0.791681348704688 | 0.627 | 1.254 | 1.88 |
| -0.788539756051099 | 0.622 | 1.244 | 1.865 |
| -0.785398163397509 | 0.617 | 1.234 | 1.851 |
| -0.782256570743919 | 0.612 | 1.224 | 1.836 |
| -0.779114978090329 | 0.607 | 1.214 | 1.821 |
| -0.775973385436739 | 0.602 | 1.204 | 1.806 |
| -0.77283179278315 | 0.597 | 1.195 | 1.792 |
| -0.76969020012956 | 0.592 | 1.185 | 1.777 |
| -0.76654860747597 | 0.588 | 1.175 | 1.763 |
| -0.76340701482238 | 0.583 | 1.166 | 1.748 |
| -0.76026542216879 | 0.578 | 1.156 | 1.734 |
| -0.7571238295152 | 0.573 | 1.146 | 1.72 |
| -0.753982236861611 | 0.568 | 1.137 | 1.705 |
| -0.750840644208021 | 0.564 | 1.128 | 1.691 |
| -0.747699051554431 | 0.559 | 1.118 | 1.677 |
| -0.744557458900841 | 0.554 | 1.109 | 1.663 |
| -0.741415866247251 | 0.55 | 1.099 | 1.649 |
| -0.738274273593662 | 0.545 | 1.09 | 1.635 |
| -0.735132680940072 | 0.54 | 1.081 | 1.621 |
| -0.731991088286482 | 0.536 | 1.072 | 1.607 |
| -0.728849495632892 | 0.531 | 1.062 | 1.594 |
| -0.725707902979302 | 0.527 | 1.053 | 1.58 |
| -0.722566310325712 | 0.522 | 1.044 | 1.566 |
| -0.719424717672123 | 0.518 | 1.035 | 1.553 |
| -0.716283125018533 | 0.513 | 1.026 | 1.539 |
| -0.713141532364943 | 0.509 | 1.017 | 1.526 |
| -0.709999939711353 | 0.504 | 1.008 | 1.512 |
| -0.706858347057763 | 0.5 | 0.999 | 1.499 |
| -0.703716754404174 | 0.495 | 0.99 | 1.486 |
| -0.700575161750584 | 0.491 | 0.982 | 1.472 |
| -0.697433569096994 | 0.486 | 0.973 | 1.459 |
| -0.694291976443404 | 0.482 | 0.964 | 1.446 |
| -0.691150383789814 | 0.478 | 0.955 | 1.433 |
| -0.688008791136224 | 0.473 | 0.947 | 1.42 |
| -0.684867198482635 | 0.469 | 0.938 | 1.407 |
| -0.681725605829045 | 0.465 | 0.929 | 1.394 |
| -0.678584013175455 | 0.46 | 0.921 | 1.381 |
| -0.675442420521865 | 0.456 | 0.912 | 1.369 |
| -0.672300827868275 | 0.452 | 0.904 | 1.356 |
| -0.669159235214685 | 0.448 | 0.896 | 1.343 |
| -0.666017642561096 | 0.444 | 0.887 | 1.331 |
| -0.662876049907506 | 0.439 | 0.879 | 1.318 |
| -0.659734457253916 | 0.435 | 0.87 | 1.306 |
| -0.656592864600326 | 0.431 | 0.862 | 1.293 |
| -0.653451271946736 | 0.427 | 0.854 | 1.281 |
| -0.650309679293147 | 0.423 | 0.846 | 1.269 |
| -0.647168086639557 | 0.419 | 0.838 | 1.256 |
| -0.644026493985967 | 0.415 | 0.83 | 1.244 |
| -0.640884901332377 | 0.411 | 0.821 | 1.232 |
| -0.637743308678787 | 0.407 | 0.813 | 1.22 |
| -0.634601716025197 | 0.403 | 0.805 | 1.208 |
| -0.631460123371608 | 0.399 | 0.797 | 1.196 |
| -0.628318530718018 | 0.395 | 0.79 | 1.184 |
| -0.625176938064428 | 0.391 | 0.782 | 1.173 |
| -0.622035345410838 | 0.387 | 0.774 | 1.161 |
| -0.618893752757248 | 0.383 | 0.766 | 1.149 |
| -0.615752160103659 | 0.379 | 0.758 | 1.137 |
| -0.612610567450069 | 0.375 | 0.751 | 1.126 |
| -0.609468974796479 | 0.371 | 0.743 | 1.114 |
| -0.606327382142889 | 0.368 | 0.735 | 1.103 |
| -0.603185789489299 | 0.364 | 0.728 | 1.091 |
| -0.600044196835709 | 0.36 | 0.72 | 1.08 |
| -0.59690260418212 | 0.356 | 0.713 | 1.069 |
| -0.59376101152853 | 0.353 | 0.705 | 1.058 |
| -0.59061941887494 | 0.349 | 0.698 | 1.046 |
| -0.58747782622135 | 0.345 | 0.69 | 1.035 |
| -0.58433623356776 | 0.341 | 0.683 | 1.024 |
| -0.581194640914171 | 0.338 | 0.676 | 1.013 |
| -0.578053048260581 | 0.334 | 0.668 | 1.002 |
| -0.574911455606991 | 0.331 | 0.661 | 0.992 |
| -0.571769862953401 | 0.327 | 0.654 | 0.981 |
| -0.568628270299811 | 0.323 | 0.647 | 0.97 |
| -0.565486677646222 | 0.32 | 0.64 | 0.959 |
| -0.562345084992632 | 0.316 | 0.632 | 0.949 |
| -0.559203492339042 | 0.313 | 0.625 | 0.938 |
| -0.556061899685452 | 0.309 | 0.618 | 0.928 |
| -0.552920307031862 | 0.306 | 0.611 | 0.917 |
| -0.549778714378272 | 0.302 | 0.605 | 0.907 |
| -0.546637121724683 | 0.299 | 0.598 | 0.896 |
| -0.543495529071093 | 0.295 | 0.591 | 0.886 |
| -0.540353936417503 | 0.292 | 0.584 | 0.876 |
| -0.537212343763913 | 0.289 | 0.577 | 0.866 |
| -0.534070751110323 | 0.285 | 0.57 | 0.856 |
| -0.530929158456733 | 0.282 | 0.564 | 0.846 |
| -0.527787565803144 | 0.279 | 0.557 | 0.836 |
| -0.524645973149554 | 0.275 | 0.551 | 0.826 |
| -0.521504380495964 | 0.272 | 0.544 | 0.816 |
| -0.518362787842374 | 0.269 | 0.537 | 0.806 |
| -0.515221195188784 | 0.265 | 0.531 | 0.796 |
| -0.512079602535195 | 0.262 | 0.524 | 0.787 |
| -0.508938009881605 | 0.259 | 0.518 | 0.777 |
| -0.505796417228015 | 0.256 | 0.512 | 0.767 |
| -0.502654824574425 | 0.253 | 0.505 | 0.758 |
| -0.499513231920835 | 0.25 | 0.499 | 0.749 |
| -0.496371639267245 | 0.246 | 0.493 | 0.739 |
| -0.493230046613656 | 0.243 | 0.487 | 0.73 |
| -0.490088453960066 | 0.24 | 0.48 | 0.721 |
| -0.486946861306476 | 0.237 | 0.474 | 0.711 |
| -0.483805268652886 | 0.234 | 0.468 | 0.702 |
| -0.480663675999296 | 0.231 | 0.462 | 0.693 |
| -0.477522083345707 | 0.228 | 0.456 | 0.684 |
| -0.474380490692117 | 0.225 | 0.45 | 0.675 |
| -0.471238898038527 | 0.222 | 0.444 | 0.666 |
| -0.468097305384937 | 0.219 | 0.438 | 0.657 |
| -0.464955712731347 | 0.216 | 0.432 | 0.649 |
| -0.461814120077757 | 0.213 | 0.427 | 0.64 |
| -0.458672527424168 | 0.21 | 0.421 | 0.631 |
| -0.455530934770578 | 0.208 | 0.415 | 0.623 |
| -0.452389342116988 | 0.205 | 0.409 | 0.614 |
| -0.449247749463398 | 0.202 | 0.404 | 0.605 |
| -0.446106156809808 | 0.199 | 0.398 | 0.597 |
| -0.442964564156219 | 0.196 | 0.392 | 0.589 |
| -0.439822971502629 | 0.193 | 0.387 | 0.58 |
| -0.436681378849039 | 0.191 | 0.381 | 0.572 |
| -0.433539786195449 | 0.188 | 0.376 | 0.564 |
| -0.430398193541859 | 0.185 | 0.37 | 0.556 |
| -0.427256600888269 | 0.183 | 0.365 | 0.548 |
| -0.42411500823468 | 0.18 | 0.36 | 0.54 |
| -0.42097341558109 | 0.177 | 0.354 | 0.532 |
| -0.4178318229275 | 0.175 | 0.349 | 0.524 |
| -0.41469023027391 | 0.172 | 0.344 | 0.516 |
| -0.41154863762032 | 0.169 | 0.339 | 0.508 |
| -0.408407044966731 | 0.167 | 0.334 | 0.5 |
| -0.405265452313141 | 0.164 | 0.328 | 0.493 |
| -0.402123859659551 | 0.162 | 0.323 | 0.485 |
| -0.398982267005961 | 0.159 | 0.318 | 0.478 |
| -0.395840674352371 | 0.157 | 0.313 | 0.47 |
| -0.392699081698781 | 0.154 | 0.308 | 0.463 |
| -0.389557489045192 | 0.152 | 0.304 | 0.455 |
| -0.386415896391602 | 0.149 | 0.299 | 0.448 |
| -0.383274303738012 | 0.147 | 0.294 | 0.441 |
| -0.380132711084422 | 0.145 | 0.289 | 0.434 |
| -0.376991118430832 | 0.142 | 0.284 | 0.426 |
| -0.373849525777242 | 0.14 | 0.28 | 0.419 |
| -0.370707933123653 | 0.137 | 0.275 | 0.412 |
| -0.367566340470063 | 0.135 | 0.27 | 0.405 |
| -0.364424747816473 | 0.133 | 0.266 | 0.398 |
| -0.361283155162883 | 0.131 | 0.261 | 0.392 |
| -0.358141562509293 | 0.128 | 0.257 | 0.385 |
| -0.354999969855704 | 0.126 | 0.252 | 0.378 |
| -0.351858377202114 | 0.124 | 0.248 | 0.371 |
| -0.348716784548524 | 0.122 | 0.243 | 0.365 |
| -0.345575191894934 | 0.119 | 0.239 | 0.358 |
| -0.342433599241344 | 0.117 | 0.235 | 0.352 |
| -0.339292006587754 | 0.115 | 0.23 | 0.345 |
| -0.336150413934165 | 0.113 | 0.226 | 0.339 |
| -0.333008821280575 | 0.111 | 0.222 | 0.333 |
| -0.329867228626985 | 0.109 | 0.218 | 0.326 |
| -0.326725635973395 | 0.107 | 0.213 | 0.32 |
| -0.323584043319805 | 0.105 | 0.209 | 0.314 |
| -0.320442450666216 | 0.103 | 0.205 | 0.308 |
| -0.317300858012626 | 0.101 | 0.201 | 0.302 |
| -0.314159265359036 | 0.099 | 0.197 | 0.296 |
| -0.311017672705446 | 0.097 | 0.193 | 0.29 |
| -0.307876080051856 | 0.095 | 0.19 | 0.284 |
| -0.304734487398266 | 0.093 | 0.186 | 0.279 |
| -0.301592894744677 | 0.091 | 0.182 | 0.273 |
| -0.298451302091087 | 0.089 | 0.178 | 0.267 |
| -0.295309709437497 | 0.087 | 0.174 | 0.262 |
| -0.292168116783907 | 0.085 | 0.171 | 0.256 |
| -0.289026524130317 | 0.084 | 0.167 | 0.251 |
| -0.285884931476728 | 0.082 | 0.163 | 0.245 |
| -0.282743338823138 | 0.08 | 0.16 | 0.24 |
| -0.279601746169548 | 0.078 | 0.156 | 0.235 |
| -0.276460153515958 | 0.076 | 0.153 | 0.229 |
| -0.273318560862368 | 0.075 | 0.149 | 0.224 |
| -0.270176968208778 | 0.073 | 0.146 | 0.219 |
| -0.267035375555189 | 0.071 | 0.143 | 0.214 |
| -0.263893782901599 | 0.07 | 0.139 | 0.209 |
| -0.260752190248009 | 0.068 | 0.136 | 0.204 |
| -0.257610597594419 | 0.066 | 0.133 | 0.199 |
| -0.254469004940829 | 0.065 | 0.13 | 0.194 |
| -0.25132741228724 | 0.063 | 0.126 | 0.189 |
| -0.24818581963365 | 0.062 | 0.123 | 0.185 |
| -0.24504422698006 | 0.06 | 0.12 | 0.18 |
| -0.24190263432647 | 0.059 | 0.117 | 0.176 |
| -0.23876104167288 | 0.057 | 0.114 | 0.171 |
| -0.235619449019291 | 0.056 | 0.111 | 0.167 |
| -0.232477856365701 | 0.054 | 0.108 | 0.162 |
| -0.229336263712111 | 0.053 | 0.105 | 0.158 |
| -0.226194671058521 | 0.051 | 0.102 | 0.153 |
| -0.223053078404931 | 0.05 | 0.1 | 0.149 |
| -0.219911485751342 | 0.048 | 0.097 | 0.145 |
| -0.216769893097752 | 0.047 | 0.094 | 0.141 |
| -0.213628300444162 | 0.046 | 0.091 | 0.137 |
| -0.210486707790572 | 0.044 | 0.089 | 0.133 |
| -0.207345115136982 | 0.043 | 0.086 | 0.129 |
| -0.204203522483393 | 0.042 | 0.083 | 0.125 |
| -0.201061929829803 | 0.04 | 0.081 | 0.121 |
| -0.197920337176213 | 0.039 | 0.078 | 0.118 |
| -0.194778744522623 | 0.038 | 0.076 | 0.114 |
| -0.191637151869033 | 0.037 | 0.073 | 0.11 |
| -0.188495559215444 | 0.036 | 0.071 | 0.107 |
| -0.185353966561854 | 0.034 | 0.069 | 0.103 |
| -0.182212373908264 | 0.033 | 0.066 | 0.1 |
| -0.179070781254674 | 0.032 | 0.064 | 0.096 |
| -0.175929188601085 | 0.031 | 0.062 | 0.093 |
| -0.172787595947495 | 0.03 | 0.06 | 0.09 |
| -0.169646003293905 | 0.029 | 0.058 | 0.086 |
| -0.166504410640315 | 0.028 | 0.055 | 0.083 |
| -0.163362817986725 | 0.027 | 0.053 | 0.08 |
| -0.160221225333136 | 0.026 | 0.051 | 0.077 |
| -0.157079632679546 | 0.025 | 0.049 | 0.074 |
| -0.153938040025956 | 0.024 | 0.047 | 0.071 |
| -0.150796447372366 | 0.023 | 0.045 | 0.068 |
| -0.147654854718776 | 0.022 | 0.044 | 0.065 |
| -0.144513262065187 | 0.021 | 0.042 | 0.063 |
| -0.141371669411597 | 0.02 | 0.04 | 0.06 |
| -0.138230076758007 | 0.019 | 0.038 | 0.057 |
| -0.135088484104417 | 0.018 | 0.036 | 0.055 |
| -0.131946891450827 | 0.017 | 0.035 | 0.052 |
| -0.128805298797238 | 0.017 | 0.033 | 0.05 |
| -0.125663706143648 | 0.016 | 0.032 | 0.047 |
| -0.122522113490058 | 0.015 | 0.03 | 0.045 |
| -0.119380520836468 | 0.014 | 0.029 | 0.043 |
| -0.116238928182878 | 0.014 | 0.027 | 0.041 |
| -0.113097335529289 | 0.013 | 0.026 | 0.038 |
| -0.109955742875699 | 0.012 | 0.024 | 0.036 |
| -0.106814150222109 | 0.011 | 0.023 | 0.034 |
| -0.103672557568519 | 0.011 | 0.021 | 0.032 |
| -0.10053096491493 | 0.01 | 0.02 | 0.03 |
| -0.0973893722613397 | 0.009 | 0.019 | 0.028 |
| -0.0942477796077499 | 0.009 | 0.018 | 0.027 |
| -0.0911061869541601 | 0.008 | 0.017 | 0.025 |
| -0.0879645943005703 | 0.008 | 0.015 | 0.023 |
| -0.0848230016469805 | 0.007 | 0.014 | 0.022 |
| -0.0816814089933908 | 0.007 | 0.013 | 0.02 |
| -0.078539816339801 | 0.006 | 0.012 | 0.019 |
| -0.0753982236862112 | 0.006 | 0.011 | 0.017 |
| -0.0722566310326214 | 0.005 | 0.01 | 0.016 |
| -0.0691150383790316 | 0.005 | 0.01 | 0.014 |
| -0.0659734457254418 | 0.004 | 0.009 | 0.013 |
| -0.062831853071852 | 0.004 | 0.008 | 0.012 |
| -0.0596902604182622 | 0.004 | 0.007 | 0.011 |
| -0.0565486677646724 | 0.003 | 0.006 | 0.01 |
| -0.0534070751110826 | 0.003 | 0.006 | 0.009 |
| -0.0502654824574928 | 0.003 | 0.005 | 0.008 |
| -0.047123889803903 | 0.002 | 0.004 | 0.007 |
| -0.0439822971503133 | 0.002 | 0.004 | 0.006 |
| -0.0408407044967235 | 0.002 | 0.003 | 0.005 |
| -0.0376991118431337 | 0.001 | 0.003 | 0.004 |
| -0.0345575191895439 | 0.001 | 0.002 | 0.004 |
| -0.0314159265359541 | 0.001 | 0.002 | 0.003 |
| -0.0282743338823643 | 0.001 | 0.002 | 0.002 |
| -0.0251327412287745 | 0.001 | 0.001 | 0.002 |
| -0.0219911485751847 | 0 | 0.001 | 0.001 |
| -0.0188495559215949 | 0 | 0.001 | 0.001 |
| -0.0157079632680051 | 0 | 0 | 0.001 |
| -0.0125663706144153 | 0 | 0 | 0 |
| -0.00942477796082555 | 0 | 0 | 0 |
| -0.00628318530723575 | 0 | 0 | 0 |
| -0.00314159265364596 | 0 | 0 | 0 |
| -5.6169478790391e-14 | 0 | 0 | 0 |
| 0.00314159265353362 | 0 | 0 | 0 |
| 0.00628318530712342 | 0 | 0 | 0 |
| 0.00942477796071321 | 0 | 0 | 0 |
| 0.012566370614303 | 0 | 0 | 0 |
| 0.0157079632678928 | 0 | 0 | 0.001 |
| 0.0188495559214826 | 0 | 0.001 | 0.001 |
| 0.0219911485750724 | 0 | 0.001 | 0.001 |
| 0.0251327412286622 | 0.001 | 0.001 | 0.002 |
| 0.028274333882252 | 0.001 | 0.002 | 0.002 |
| 0.0314159265358418 | 0.001 | 0.002 | 0.003 |
| 0.0345575191894315 | 0.001 | 0.002 | 0.004 |
| 0.0376991118430213 | 0.001 | 0.003 | 0.004 |
| 0.0408407044966111 | 0.002 | 0.003 | 0.005 |
| 0.0439822971502009 | 0.002 | 0.004 | 0.006 |
| 0.0471238898037907 | 0.002 | 0.004 | 0.007 |
| 0.0502654824573805 | 0.003 | 0.005 | 0.008 |
| 0.0534070751109703 | 0.003 | 0.006 | 0.009 |
| 0.0565486677645601 | 0.003 | 0.006 | 0.01 |
| 0.0596902604181499 | 0.004 | 0.007 | 0.011 |
| 0.0628318530717397 | 0.004 | 0.008 | 0.012 |
| 0.0659734457253295 | 0.004 | 0.009 | 0.013 |
| 0.0691150383789192 | 0.005 | 0.01 | 0.014 |
| 0.072256631032509 | 0.005 | 0.01 | 0.016 |
| 0.0753982236860988 | 0.006 | 0.011 | 0.017 |
| 0.0785398163396886 | 0.006 | 0.012 | 0.019 |
| 0.0816814089932784 | 0.007 | 0.013 | 0.02 |
| 0.0848230016468682 | 0.007 | 0.014 | 0.022 |
| 0.087964594300458 | 0.008 | 0.015 | 0.023 |
| 0.0911061869540478 | 0.008 | 0.017 | 0.025 |
| 0.0942477796076376 | 0.009 | 0.018 | 0.027 |
| 0.0973893722612274 | 0.009 | 0.019 | 0.028 |
| 0.100530964914817 | 0.01 | 0.02 | 0.03 |
| 0.103672557568407 | 0.011 | 0.021 | 0.032 |
| 0.106814150221997 | 0.011 | 0.023 | 0.034 |
| 0.109955742875587 | 0.012 | 0.024 | 0.036 |
| 0.113097335529176 | 0.013 | 0.026 | 0.038 |
| 0.116238928182766 | 0.014 | 0.027 | 0.041 |
| 0.119380520836356 | 0.014 | 0.029 | 0.043 |
| 0.122522113489946 | 0.015 | 0.03 | 0.045 |
| 0.125663706143536 | 0.016 | 0.032 | 0.047 |
| 0.128805298797125 | 0.017 | 0.033 | 0.05 |
| 0.131946891450715 | 0.017 | 0.035 | 0.052 |
| 0.135088484104305 | 0.018 | 0.036 | 0.055 |
| 0.138230076757895 | 0.019 | 0.038 | 0.057 |
| 0.141371669411484 | 0.02 | 0.04 | 0.06 |
| 0.144513262065074 | 0.021 | 0.042 | 0.063 |
| 0.147654854718664 | 0.022 | 0.044 | 0.065 |
| 0.150796447372254 | 0.023 | 0.045 | 0.068 |
| 0.153938040025844 | 0.024 | 0.047 | 0.071 |
| 0.157079632679433 | 0.025 | 0.049 | 0.074 |
| 0.160221225333023 | 0.026 | 0.051 | 0.077 |
| 0.163362817986613 | 0.027 | 0.053 | 0.08 |
| 0.166504410640203 | 0.028 | 0.055 | 0.083 |
| 0.169646003293793 | 0.029 | 0.058 | 0.086 |
| 0.172787595947382 | 0.03 | 0.06 | 0.09 |
| 0.175929188600972 | 0.031 | 0.062 | 0.093 |
| 0.179070781254562 | 0.032 | 0.064 | 0.096 |
| 0.182212373908152 | 0.033 | 0.066 | 0.1 |
| 0.185353966561742 | 0.034 | 0.069 | 0.103 |
| 0.188495559215331 | 0.036 | 0.071 | 0.107 |
| 0.191637151868921 | 0.037 | 0.073 | 0.11 |
| 0.194778744522511 | 0.038 | 0.076 | 0.114 |
| 0.197920337176101 | 0.039 | 0.078 | 0.118 |
| 0.201061929829691 | 0.04 | 0.081 | 0.121 |
| 0.20420352248328 | 0.042 | 0.083 | 0.125 |
| 0.20734511513687 | 0.043 | 0.086 | 0.129 |
| 0.21048670779046 | 0.044 | 0.089 | 0.133 |
| 0.21362830044405 | 0.046 | 0.091 | 0.137 |
| 0.216769893097639 | 0.047 | 0.094 | 0.141 |
| 0.219911485751229 | 0.048 | 0.097 | 0.145 |
| 0.223053078404819 | 0.05 | 0.1 | 0.149 |
| 0.226194671058409 | 0.051 | 0.102 | 0.153 |
| 0.229336263711999 | 0.053 | 0.105 | 0.158 |
| 0.232477856365588 | 0.054 | 0.108 | 0.162 |
| 0.235619449019178 | 0.056 | 0.111 | 0.167 |
| 0.238761041672768 | 0.057 | 0.114 | 0.171 |
| 0.241902634326358 | 0.059 | 0.117 | 0.176 |
| 0.245044226979948 | 0.06 | 0.12 | 0.18 |
| 0.248185819633537 | 0.062 | 0.123 | 0.185 |
| 0.251327412287127 | 0.063 | 0.126 | 0.189 |
| 0.254469004940717 | 0.065 | 0.13 | 0.194 |
| 0.257610597594307 | 0.066 | 0.133 | 0.199 |
| 0.260752190247897 | 0.068 | 0.136 | 0.204 |
| 0.263893782901486 | 0.07 | 0.139 | 0.209 |
| 0.267035375555076 | 0.071 | 0.143 | 0.214 |
| 0.270176968208666 | 0.073 | 0.146 | 0.219 |
| 0.273318560862256 | 0.075 | 0.149 | 0.224 |
| 0.276460153515846 | 0.076 | 0.153 | 0.229 |
| 0.279601746169436 | 0.078 | 0.156 | 0.235 |
| 0.282743338823025 | 0.08 | 0.16 | 0.24 |
| 0.285884931476615 | 0.082 | 0.163 | 0.245 |
| 0.289026524130205 | 0.084 | 0.167 | 0.251 |
| 0.292168116783795 | 0.085 | 0.171 | 0.256 |
| 0.295309709437385 | 0.087 | 0.174 | 0.262 |
| 0.298451302090974 | 0.089 | 0.178 | 0.267 |
| 0.301592894744564 | 0.091 | 0.182 | 0.273 |
| 0.304734487398154 | 0.093 | 0.186 | 0.279 |
| 0.307876080051744 | 0.095 | 0.19 | 0.284 |
| 0.311017672705334 | 0.097 | 0.193 | 0.29 |
| 0.314159265358924 | 0.099 | 0.197 | 0.296 |
| 0.317300858012513 | 0.101 | 0.201 | 0.302 |
| 0.320442450666103 | 0.103 | 0.205 | 0.308 |
| 0.323584043319693 | 0.105 | 0.209 | 0.314 |
| 0.326725635973283 | 0.107 | 0.213 | 0.32 |
| 0.329867228626873 | 0.109 | 0.218 | 0.326 |
| 0.333008821280463 | 0.111 | 0.222 | 0.333 |
| 0.336150413934052 | 0.113 | 0.226 | 0.339 |
| 0.339292006587642 | 0.115 | 0.23 | 0.345 |
| 0.342433599241232 | 0.117 | 0.235 | 0.352 |
| 0.345575191894822 | 0.119 | 0.239 | 0.358 |
| 0.348716784548412 | 0.122 | 0.243 | 0.365 |
| 0.351858377202001 | 0.124 | 0.248 | 0.371 |
| 0.354999969855591 | 0.126 | 0.252 | 0.378 |
| 0.358141562509181 | 0.128 | 0.257 | 0.385 |
| 0.361283155162771 | 0.131 | 0.261 | 0.392 |
| 0.364424747816361 | 0.133 | 0.266 | 0.398 |
| 0.367566340469951 | 0.135 | 0.27 | 0.405 |
| 0.37070793312354 | 0.137 | 0.275 | 0.412 |
| 0.37384952577713 | 0.14 | 0.28 | 0.419 |
| 0.37699111843072 | 0.142 | 0.284 | 0.426 |
| 0.38013271108431 | 0.145 | 0.289 | 0.434 |
| 0.3832743037379 | 0.147 | 0.294 | 0.441 |
| 0.386415896391489 | 0.149 | 0.299 | 0.448 |
| 0.389557489045079 | 0.152 | 0.304 | 0.455 |
| 0.392699081698669 | 0.154 | 0.308 | 0.463 |
| 0.395840674352259 | 0.157 | 0.313 | 0.47 |
| 0.398982267005849 | 0.159 | 0.318 | 0.478 |
| 0.402123859659439 | 0.162 | 0.323 | 0.485 |
| 0.405265452313028 | 0.164 | 0.328 | 0.493 |
| 0.408407044966618 | 0.167 | 0.334 | 0.5 |
| 0.411548637620208 | 0.169 | 0.339 | 0.508 |
| 0.414690230273798 | 0.172 | 0.344 | 0.516 |
| 0.417831822927388 | 0.175 | 0.349 | 0.524 |
| 0.420973415580977 | 0.177 | 0.354 | 0.532 |
| 0.424115008234567 | 0.18 | 0.36 | 0.54 |
| 0.427256600888157 | 0.183 | 0.365 | 0.548 |
| 0.430398193541747 | 0.185 | 0.37 | 0.556 |
| 0.433539786195337 | 0.188 | 0.376 | 0.564 |
| 0.436681378848927 | 0.191 | 0.381 | 0.572 |
| 0.439822971502516 | 0.193 | 0.387 | 0.58 |
| 0.442964564156106 | 0.196 | 0.392 | 0.589 |
| 0.446106156809696 | 0.199 | 0.398 | 0.597 |
| 0.449247749463286 | 0.202 | 0.404 | 0.605 |
| 0.452389342116876 | 0.205 | 0.409 | 0.614 |
| 0.455530934770465 | 0.208 | 0.415 | 0.623 |
| 0.458672527424055 | 0.21 | 0.421 | 0.631 |
| 0.461814120077645 | 0.213 | 0.427 | 0.64 |
| 0.464955712731235 | 0.216 | 0.432 | 0.649 |
| 0.468097305384825 | 0.219 | 0.438 | 0.657 |
| 0.471238898038415 | 0.222 | 0.444 | 0.666 |
| 0.474380490692004 | 0.225 | 0.45 | 0.675 |
| 0.477522083345594 | 0.228 | 0.456 | 0.684 |
| 0.480663675999184 | 0.231 | 0.462 | 0.693 |
| 0.483805268652774 | 0.234 | 0.468 | 0.702 |
| 0.486946861306364 | 0.237 | 0.474 | 0.711 |
| 0.490088453959953 | 0.24 | 0.48 | 0.721 |
| 0.493230046613543 | 0.243 | 0.487 | 0.73 |
| 0.496371639267133 | 0.246 | 0.493 | 0.739 |
| 0.499513231920723 | 0.25 | 0.499 | 0.749 |
| 0.502654824574313 | 0.253 | 0.505 | 0.758 |
| 0.505796417227903 | 0.256 | 0.512 | 0.767 |
| 0.508938009881492 | 0.259 | 0.518 | 0.777 |
| 0.512079602535082 | 0.262 | 0.524 | 0.787 |
| 0.515221195188672 | 0.265 | 0.531 | 0.796 |
| 0.518362787842262 | 0.269 | 0.537 | 0.806 |
| 0.521504380495852 | 0.272 | 0.544 | 0.816 |
| 0.524645973149441 | 0.275 | 0.551 | 0.826 |
| 0.527787565803031 | 0.279 | 0.557 | 0.836 |
| 0.530929158456621 | 0.282 | 0.564 | 0.846 |
| 0.534070751110211 | 0.285 | 0.57 | 0.856 |
| 0.537212343763801 | 0.289 | 0.577 | 0.866 |
| 0.540353936417391 | 0.292 | 0.584 | 0.876 |
| 0.54349552907098 | 0.295 | 0.591 | 0.886 |
| 0.54663712172457 | 0.299 | 0.598 | 0.896 |
| 0.54977871437816 | 0.302 | 0.605 | 0.907 |
| 0.55292030703175 | 0.306 | 0.611 | 0.917 |
| 0.55606189968534 | 0.309 | 0.618 | 0.928 |
| 0.55920349233893 | 0.313 | 0.625 | 0.938 |
| 0.562345084992519 | 0.316 | 0.632 | 0.949 |
| 0.565486677646109 | 0.32 | 0.64 | 0.959 |
| 0.568628270299699 | 0.323 | 0.647 | 0.97 |
| 0.571769862953289 | 0.327 | 0.654 | 0.981 |
| 0.574911455606879 | 0.331 | 0.661 | 0.992 |
| 0.578053048260468 | 0.334 | 0.668 | 1.002 |
| 0.581194640914058 | 0.338 | 0.676 | 1.013 |
| 0.584336233567648 | 0.341 | 0.683 | 1.024 |
| 0.587477826221238 | 0.345 | 0.69 | 1.035 |
| 0.590619418874828 | 0.349 | 0.698 | 1.046 |
| 0.593761011528418 | 0.353 | 0.705 | 1.058 |
| 0.596902604182007 | 0.356 | 0.713 | 1.069 |
| 0.600044196835597 | 0.36 | 0.72 | 1.08 |
| 0.603185789489187 | 0.364 | 0.728 | 1.091 |
| 0.606327382142777 | 0.368 | 0.735 | 1.103 |
| 0.609468974796367 | 0.371 | 0.743 | 1.114 |
| 0.612610567449956 | 0.375 | 0.751 | 1.126 |
| 0.615752160103546 | 0.379 | 0.758 | 1.137 |
| 0.618893752757136 | 0.383 | 0.766 | 1.149 |
| 0.622035345410726 | 0.387 | 0.774 | 1.161 |
| 0.625176938064316 | 0.391 | 0.782 | 1.173 |
| 0.628318530717905 | 0.395 | 0.79 | 1.184 |
| 0.631460123371495 | 0.399 | 0.797 | 1.196 |
| 0.634601716025085 | 0.403 | 0.805 | 1.208 |
| 0.637743308678675 | 0.407 | 0.813 | 1.22 |
| 0.640884901332265 | 0.411 | 0.821 | 1.232 |
| 0.644026493985855 | 0.415 | 0.83 | 1.244 |
| 0.647168086639444 | 0.419 | 0.838 | 1.256 |
| 0.650309679293034 | 0.423 | 0.846 | 1.269 |
| 0.653451271946624 | 0.427 | 0.854 | 1.281 |
| 0.656592864600214 | 0.431 | 0.862 | 1.293 |
| 0.659734457253804 | 0.435 | 0.87 | 1.306 |
| 0.662876049907393 | 0.439 | 0.879 | 1.318 |
| 0.666017642560983 | 0.444 | 0.887 | 1.331 |
| 0.669159235214573 | 0.448 | 0.896 | 1.343 |
| 0.672300827868163 | 0.452 | 0.904 | 1.356 |
| 0.675442420521753 | 0.456 | 0.912 | 1.369 |
| 0.678584013175343 | 0.46 | 0.921 | 1.381 |
| 0.681725605828932 | 0.465 | 0.929 | 1.394 |
| 0.684867198482522 | 0.469 | 0.938 | 1.407 |
| 0.688008791136112 | 0.473 | 0.947 | 1.42 |
| 0.691150383789702 | 0.478 | 0.955 | 1.433 |
| 0.694291976443292 | 0.482 | 0.964 | 1.446 |
| 0.697433569096881 | 0.486 | 0.973 | 1.459 |
| 0.700575161750471 | 0.491 | 0.982 | 1.472 |
| 0.703716754404061 | 0.495 | 0.99 | 1.486 |
| 0.706858347057651 | 0.5 | 0.999 | 1.499 |
| 0.709999939711241 | 0.504 | 1.008 | 1.512 |
| 0.713141532364831 | 0.509 | 1.017 | 1.526 |
| 0.71628312501842 | 0.513 | 1.026 | 1.539 |
| 0.71942471767201 | 0.518 | 1.035 | 1.553 |
| 0.7225663103256 | 0.522 | 1.044 | 1.566 |
| 0.72570790297919 | 0.527 | 1.053 | 1.58 |
| 0.72884949563278 | 0.531 | 1.062 | 1.594 |
| 0.73199108828637 | 0.536 | 1.072 | 1.607 |
| 0.735132680939959 | 0.54 | 1.081 | 1.621 |
| 0.738274273593549 | 0.545 | 1.09 | 1.635 |
| 0.741415866247139 | 0.55 | 1.099 | 1.649 |
| 0.744557458900729 | 0.554 | 1.109 | 1.663 |
| 0.747699051554319 | 0.559 | 1.118 | 1.677 |
| 0.750840644207908 | 0.564 | 1.128 | 1.691 |
| 0.753982236861498 | 0.568 | 1.137 | 1.705 |
| 0.757123829515088 | 0.573 | 1.146 | 1.72 |
| 0.760265422168678 | 0.578 | 1.156 | 1.734 |
| 0.763407014822268 | 0.583 | 1.166 | 1.748 |
| 0.766548607475858 | 0.588 | 1.175 | 1.763 |
| 0.769690200129447 | 0.592 | 1.185 | 1.777 |
| 0.772831792783037 | 0.597 | 1.195 | 1.792 |
| 0.775973385436627 | 0.602 | 1.204 | 1.806 |
| 0.779114978090217 | 0.607 | 1.214 | 1.821 |
| 0.782256570743807 | 0.612 | 1.224 | 1.836 |
| 0.785398163397396 | 0.617 | 1.234 | 1.851 |
| 0.788539756050986 | 0.622 | 1.244 | 1.865 |
| 0.791681348704576 | 0.627 | 1.254 | 1.88 |
| 0.794822941358166 | 0.632 | 1.263 | 1.895 |
| 0.797964534011756 | 0.637 | 1.273 | 1.91 |
| 0.801106126665346 | 0.642 | 1.284 | 1.925 |
| 0.804247719318935 | 0.647 | 1.294 | 1.94 |
| 0.807389311972525 | 0.652 | 1.304 | 1.956 |
| 0.810530904626115 | 0.657 | 1.314 | 1.971 |
| 0.813672497279705 | 0.662 | 1.324 | 1.986 |
| 0.816814089933295 | 0.667 | 1.334 | 2.002 |
| 0.819955682586885 | 0.672 | 1.345 | 2.017 |
| 0.823097275240474 | 0.677 | 1.355 | 2.032 |
| 0.826238867894064 | 0.683 | 1.365 | 2.048 |
| 0.829380460547654 | 0.688 | 1.376 | 2.064 |
| 0.832522053201244 | 0.693 | 1.386 | 2.079 |
| 0.835663645854834 | 0.698 | 1.397 | 2.095 |
| 0.838805238508423 | 0.704 | 1.407 | 2.111 |
| 0.841946831162013 | 0.709 | 1.418 | 2.127 |
| 0.845088423815603 | 0.714 | 1.428 | 2.143 |
| 0.848230016469193 | 0.719 | 1.439 | 2.158 |
| 0.851371609122783 | 0.725 | 1.45 | 2.175 |
| 0.854513201776373 | 0.73 | 1.46 | 2.191 |
| 0.857654794429962 | 0.736 | 1.471 | 2.207 |
| 0.860796387083552 | 0.741 | 1.482 | 2.223 |
| 0.863937979737142 | 0.746 | 1.493 | 2.239 |
| 0.867079572390732 | 0.752 | 1.504 | 2.255 |
| 0.870221165044322 | 0.757 | 1.515 | 2.272 |
| 0.873362757697911 | 0.763 | 1.526 | 2.288 |
| 0.876504350351501 | 0.768 | 1.537 | 2.305 |
| 0.879645943005091 | 0.774 | 1.548 | 2.321 |
| 0.882787535658681 | 0.779 | 1.559 | 2.338 |
| 0.885929128312271 | 0.785 | 1.57 | 2.355 |
| 0.889070720965861 | 0.79 | 1.581 | 2.371 |
| 0.89221231361945 | 0.796 | 1.592 | 2.388 |
| 0.89535390627304 | 0.802 | 1.603 | 2.405 |
| 0.89849549892663 | 0.807 | 1.615 | 2.422 |
| 0.90163709158022 | 0.813 | 1.626 | 2.439 |
| 0.90477868423381 | 0.819 | 1.637 | 2.456 |
| 0.907920276887399 | 0.824 | 1.649 | 2.473 |
| 0.911061869540989 | 0.83 | 1.66 | 2.49 |
| 0.914203462194579 | 0.836 | 1.672 | 2.507 |
| 0.917345054848169 | 0.842 | 1.683 | 2.525 |
| 0.920486647501759 | 0.847 | 1.695 | 2.542 |
| 0.923628240155349 | 0.853 | 1.706 | 2.559 |
| 0.926769832808938 | 0.859 | 1.718 | 2.577 |
| 0.929911425462528 | 0.865 | 1.729 | 2.594 |
| 0.933053018116118 | 0.871 | 1.741 | 2.612 |
| 0.936194610769708 | 0.876 | 1.753 | 2.629 |
| 0.939336203423298 | 0.882 | 1.765 | 2.647 |
| 0.942477796076888 | 0.888 | 1.777 | 2.665 |
| 0.945619388730477 | 0.894 | 1.788 | 2.683 |
| 0.948760981384067 | 0.9 | 1.8 | 2.7 |
| 0.951902574037657 | 0.906 | 1.812 | 2.718 |
| 0.955044166691247 | 0.912 | 1.824 | 2.736 |
| 0.958185759344837 | 0.918 | 1.836 | 2.754 |
| 0.961327351998426 | 0.924 | 1.848 | 2.772 |
| 0.964468944652016 | 0.93 | 1.86 | 2.791 |
| 0.967610537305606 | 0.936 | 1.873 | 2.809 |
| 0.970752129959196 | 0.942 | 1.885 | 2.827 |
| 0.973893722612786 | 0.948 | 1.897 | 2.845 |
| 0.977035315266376 | 0.955 | 1.909 | 2.864 |
| 0.980176907919965 | 0.961 | 1.921 | 2.882 |
| 0.983318500573555 | 0.967 | 1.934 | 2.901 |
| 0.986460093227145 | 0.973 | 1.946 | 2.919 |
| 0.989601685880735 | 0.979 | 1.959 | 2.938 |
| 0.992743278534325 | 0.986 | 1.971 | 2.957 |
| 0.995884871187914 | 0.992 | 1.984 | 2.975 |
| 0.999026463841504 | 0.998 | 1.996 | 2.994 |
| 1.002168056495094 | 1.004 | 2.009 | 3.013 |
| 1.005309649148684 | 1.011 | 2.021 | 3.032 |
| 1.008451241802274 | 1.017 | 2.034 | 3.051 |
| 1.011592834455864 | 1.023 | 2.047 | 3.07 |
| 1.014734427109453 | 1.03 | 2.059 | 3.089 |
| 1.017876019763043 | 1.036 | 2.072 | 3.108 |
| 1.021017612416633 | 1.042 | 2.085 | 3.127 |
| 1.024159205070223 | 1.049 | 2.098 | 3.147 |
| 1.027300797723813 | 1.055 | 2.111 | 3.166 |
| 1.030442390377402 | 1.062 | 2.124 | 3.185 |
| 1.033583983030992 | 1.068 | 2.137 | 3.205 |
| 1.036725575684582 | 1.075 | 2.15 | 3.224 |
| 1.039867168338172 | 1.081 | 2.163 | 3.244 |
| 1.043008760991762 | 1.088 | 2.176 | 3.264 |
| 1.046150353645352 | 1.094 | 2.189 | 3.283 |
| 1.049291946298941 | 1.101 | 2.202 | 3.303 |
| 1.052433538952531 | 1.108 | 2.215 | 3.323 |
| 1.055575131606121 | 1.114 | 2.228 | 3.343 |
| 1.058716724259711 | 1.121 | 2.242 | 3.363 |
| 1.061858316913301 | 1.128 | 2.255 | 3.383 |
| 1.06499990956689 | 1.134 | 2.268 | 3.403 |
| 1.06814150222048 | 1.141 | 2.282 | 3.423 |
| 1.07128309487407 | 1.148 | 2.295 | 3.443 |
| 1.07442468752766 | 1.154 | 2.309 | 3.463 |
| 1.07756628018125 | 1.161 | 2.322 | 3.483 |
| 1.08070787283484 | 1.168 | 2.336 | 3.504 |
| 1.083849465488429 | 1.175 | 2.349 | 3.524 |
| 1.086991058142019 | 1.182 | 2.363 | 3.545 |
| 1.09013265079561 | 1.188 | 2.377 | 3.565 |
| 1.093274243449199 | 1.195 | 2.39 | 3.586 |
| 1.096415836102789 | 1.202 | 2.404 | 3.606 |
| 1.099557428756378 | 1.209 | 2.418 | 3.627 |
| 1.102699021409968 | 1.216 | 2.432 | 3.648 |
| 1.105840614063558 | 1.223 | 2.446 | 3.669 |
| 1.108982206717148 | 1.23 | 2.46 | 3.69 |
| 1.112123799370738 | 1.237 | 2.474 | 3.71 |
| 1.115265392024328 | 1.244 | 2.488 | 3.731 |
| 1.118406984677917 | 1.251 | 2.502 | 3.753 |
| 1.121548577331507 | 1.258 | 2.516 | 3.774 |
| 1.124690169985097 | 1.265 | 2.53 | 3.795 |
| 1.127831762638687 | 1.272 | 2.544 | 3.816 |
| 1.130973355292277 | 1.279 | 2.558 | 3.837 |
| 1.134114947945867 | 1.286 | 2.572 | 3.859 |
| 1.137256540599456 | 1.293 | 2.587 | 3.88 |
| 1.140398133253046 | 1.301 | 2.601 | 3.902 |
| 1.143539725906636 | 1.308 | 2.615 | 3.923 |
| 1.146681318560226 | 1.315 | 2.63 | 3.945 |
| 1.149822911213816 | 1.322 | 2.644 | 3.966 |
| 1.152964503867405 | 1.329 | 2.659 | 3.988 |
| 1.156106096520995 | 1.337 | 2.673 | 4.01 |
| 1.159247689174585 | 1.344 | 2.688 | 4.032 |
| 1.162389281828175 | 1.351 | 2.702 | 4.053 |
| 1.165530874481765 | 1.358 | 2.717 | 4.075 |
| 1.168672467135355 | 1.366 | 2.732 | 4.097 |
| 1.171814059788944 | 1.373 | 2.746 | 4.119 |
| 1.174955652442534 | 1.381 | 2.761 | 4.142 |
| 1.178097245096124 | 1.388 | 2.776 | 4.164 |
| 1.181238837749714 | 1.395 | 2.791 | 4.186 |
| 1.184380430403304 | 1.403 | 2.806 | 4.208 |
| 1.187522023056893 | 1.41 | 2.82 | 4.231 |
| 1.190663615710483 | 1.418 | 2.835 | 4.253 |
| 1.193805208364073 | 1.425 | 2.85 | 4.276 |
| 1.196946801017663 | 1.433 | 2.865 | 4.298 |
| 1.200088393671253 | 1.44 | 2.88 | 4.321 |
| 1.203229986324843 | 1.448 | 2.896 | 4.343 |
| 1.206371578978432 | 1.455 | 2.911 | 4.366 |
| 1.209513171632022 | 1.463 | 2.926 | 4.389 |
| 1.212654764285612 | 1.471 | 2.941 | 4.412 |
| 1.215796356939202 | 1.478 | 2.956 | 4.434 |
| 1.218937949592792 | 1.486 | 2.972 | 4.457 |
| 1.222079542246381 | 1.493 | 2.987 | 4.48 |
| 1.225221134899971 | 1.501 | 3.002 | 4.504 |
| 1.228362727553561 | 1.509 | 3.018 | 4.527 |
| 1.231504320207151 | 1.517 | 3.033 | 4.55 |
| 1.234645912860741 | 1.524 | 3.049 | 4.573 |
| 1.237787505514331 | 1.532 | 3.064 | 4.596 |
| 1.24092909816792 | 1.54 | 3.08 | 4.62 |
| 1.24407069082151 | 1.548 | 3.095 | 4.643 |
| 1.2472122834751 | 1.556 | 3.111 | 4.667 |
| 1.25035387612869 | 1.563 | 3.127 | 4.69 |
| 1.25349546878228 | 1.571 | 3.143 | 4.714 |
| 1.256637061435869 | 1.579 | 3.158 | 4.737 |
| 1.259778654089459 | 1.587 | 3.174 | 4.761 |
| 1.262920246743049 | 1.595 | 3.19 | 4.785 |
| 1.266061839396639 | 1.603 | 3.206 | 4.809 |
| 1.269203432050229 | 1.611 | 3.222 | 4.833 |
| 1.272345024703819 | 1.619 | 3.238 | 4.857 |
| 1.275486617357408 | 1.627 | 3.254 | 4.881 |
| 1.278628210010998 | 1.635 | 3.27 | 4.905 |
| 1.281769802664588 | 1.643 | 3.286 | 4.929 |
| 1.284911395318178 | 1.651 | 3.302 | 4.953 |
| 1.288052987971768 | 1.659 | 3.318 | 4.977 |
| 1.291194580625357 | 1.667 | 3.334 | 5.002 |
| 1.294336173278947 | 1.675 | 3.351 | 5.026 |
| 1.297477765932537 | 1.683 | 3.367 | 5.05 |
| 1.300619358586127 | 1.692 | 3.383 | 5.075 |
| 1.303760951239717 | 1.7 | 3.4 | 5.099 |
| 1.306902543893307 | 1.708 | 3.416 | 5.124 |
| 1.310044136546896 | 1.716 | 3.432 | 5.149 |
| 1.313185729200486 | 1.724 | 3.449 | 5.173 |
| 1.316327321854076 | 1.733 | 3.465 | 5.198 |
| 1.319468914507666 | 1.741 | 3.482 | 5.223 |
| 1.322610507161256 | 1.749 | 3.499 | 5.248 |
| 1.325752099814845 | 1.758 | 3.515 | 5.273 |
| 1.328893692468435 | 1.766 | 3.532 | 5.298 |
| 1.332035285122025 | 1.774 | 3.549 | 5.323 |
| 1.335176877775615 | 1.783 | 3.565 | 5.348 |
| 1.338318470429205 | 1.791 | 3.582 | 5.373 |
| 1.341460063082795 | 1.8 | 3.599 | 5.399 |
| 1.344601655736384 | 1.808 | 3.616 | 5.424 |
| 1.347743248389974 | 1.816 | 3.633 | 5.449 |
| 1.350884841043564 | 1.825 | 3.65 | 5.475 |
| 1.354026433697154 | 1.833 | 3.667 | 5.5 |
| 1.357168026350744 | 1.842 | 3.684 | 5.526 |
| 1.360309619004334 | 1.85 | 3.701 | 5.551 |
| 1.363451211657923 | 1.859 | 3.718 | 5.577 |
| 1.366592804311513 | 1.868 | 3.735 | 5.603 |
| 1.369734396965103 | 1.876 | 3.752 | 5.629 |
| 1.372875989618693 | 1.885 | 3.77 | 5.654 |
| 1.376017582272283 | 1.893 | 3.787 | 5.68 |
| 1.379159174925872 | 1.902 | 3.804 | 5.706 |
| 1.382300767579462 | 1.911 | 3.822 | 5.732 |
| 1.385442360233052 | 1.919 | 3.839 | 5.758 |
| 1.388583952886642 | 1.928 | 3.856 | 5.784 |
| 1.391725545540232 | 1.937 | 3.874 | 5.811 |
| 1.394867138193822 | 1.946 | 3.891 | 5.837 |
| 1.398008730847411 | 1.954 | 3.909 | 5.863 |
| 1.401150323501001 | 1.963 | 3.926 | 5.89 |
| 1.404291916154591 | 1.972 | 3.944 | 5.916 |
| 1.407433508808181 | 1.981 | 3.962 | 5.943 |
| 1.410575101461771 | 1.99 | 3.979 | 5.969 |
| 1.41371669411536 | 1.999 | 3.997 | 5.996 |
| 1.41685828676895 | 2.007 | 4.015 | 6.022 |
| 1.41999987942254 | 2.016 | 4.033 | 6.049 |
| 1.42314147207613 | 2.025 | 4.051 | 6.076 |
| 1.42628306472972 | 2.034 | 4.069 | 6.103 |
| 1.42942465738331 | 2.043 | 4.087 | 6.13 |
| 1.432566250036899 | 2.052 | 4.104 | 6.157 |
| 1.435707842690489 | 2.061 | 4.123 | 6.184 |
| 1.438849435344079 | 2.07 | 4.141 | 6.211 |
| 1.441991027997669 | 2.079 | 4.159 | 6.238 |
| 1.445132620651259 | 2.088 | 4.177 | 6.265 |
| 1.448274213304848 | 2.097 | 4.195 | 6.292 |
| 1.451415805958438 | 2.107 | 4.213 | 6.32 |
| 1.454557398612028 | 2.116 | 4.231 | 6.347 |
| 1.457698991265618 | 2.125 | 4.25 | 6.375 |
| 1.460840583919208 | 2.134 | 4.268 | 6.402 |
| 1.463982176572798 | 2.143 | 4.286 | 6.43 |
| 1.467123769226387 | 2.152 | 4.305 | 6.457 |
| 1.470265361879977 | 2.162 | 4.323 | 6.485 |
| 1.473406954533567 | 2.171 | 4.342 | 6.513 |
| 1.476548547187157 | 2.18 | 4.36 | 6.541 |
| 1.479690139840747 | 2.189 | 4.379 | 6.568 |
| 1.482831732494336 | 2.199 | 4.398 | 6.596 |
| 1.485973325147926 | 2.208 | 4.416 | 6.624 |
| 1.489114917801516 | 2.217 | 4.435 | 6.652 |
| 1.492256510455106 | 2.227 | 4.454 | 6.68 |
| 1.495398103108696 | 2.236 | 4.472 | 6.709 |
| 1.498539695762286 | 2.246 | 4.491 | 6.737 |
| 1.501681288415875 | 2.255 | 4.51 | 6.765 |
| 1.504822881069465 | 2.264 | 4.529 | 6.793 |
| 1.507964473723055 | 2.274 | 4.548 | 6.822 |
| 1.511106066376645 | 2.283 | 4.567 | 6.85 |
| 1.514247659030235 | 2.293 | 4.586 | 6.879 |
| 1.517389251683825 | 2.302 | 4.605 | 6.907 |
| 1.520530844337414 | 2.312 | 4.624 | 6.936 |
| 1.523672436991004 | 2.322 | 4.643 | 6.965 |
| 1.526814029644594 | 2.331 | 4.662 | 6.993 |
| 1.529955622298184 | 2.341 | 4.682 | 7.022 |
| 1.533097214951774 | 2.35 | 4.701 | 7.051 |
| 1.536238807605363 | 2.36 | 4.72 | 7.08 |
| 1.539380400258953 | 2.37 | 4.739 | 7.109 |
| 1.542521992912543 | 2.379 | 4.759 | 7.138 |
| 1.545663585566133 | 2.389 | 4.778 | 7.167 |
| 1.548805178219723 | 2.399 | 4.798 | 7.196 |
| 1.551946770873313 | 2.409 | 4.817 | 7.226 |
| 1.555088363526902 | 2.418 | 4.837 | 7.255 |
| 1.558229956180492 | 2.428 | 4.856 | 7.284 |
| 1.561371548834082 | 2.438 | 4.876 | 7.314 |
| 1.564513141487672 | 2.448 | 4.895 | 7.343 |
| 1.567654734141262 | 2.458 | 4.915 | 7.373 |
| 1.570796326794851 | 2.467 | 4.935 | 7.402 |
| 1.573937919448441 | 2.477 | 4.955 | 7.432 |
| 1.577079512102031 | 2.487 | 4.974 | 7.462 |
| 1.580221104755621 | 2.497 | 4.994 | 7.491 |
| 1.583362697409211 | 2.507 | 5.014 | 7.521 |
| 1.586504290062801 | 2.517 | 5.034 | 7.551 |
| 1.58964588271639 | 2.527 | 5.054 | 7.581 |
| 1.59278747536998 | 2.537 | 5.074 | 7.611 |
| 1.59592906802357 | 2.547 | 5.094 | 7.641 |
| 1.59907066067716 | 2.557 | 5.114 | 7.671 |
| 1.60221225333075 | 2.567 | 5.134 | 7.701 |
| 1.605353845984339 | 2.577 | 5.154 | 7.731 |
| 1.608495438637929 | 2.587 | 5.175 | 7.762 |
| 1.61163703129152 | 2.597 | 5.195 | 7.792 |
| 1.614778623945109 | 2.608 | 5.215 | 7.823 |
| 1.617920216598699 | 2.618 | 5.235 | 7.853 |
| 1.621061809252289 | 2.628 | 5.256 | 7.884 |
| 1.624203401905878 | 2.638 | 5.276 | 7.914 |
| 1.627344994559468 | 2.648 | 5.297 | 7.945 |
| 1.630486587213058 | 2.658 | 5.317 | 7.975 |
| 1.633628179866648 | 2.669 | 5.337 | 8.006 |
| 1.636769772520238 | 2.679 | 5.358 | 8.037 |
| 1.639911365173827 | 2.689 | 5.379 | 8.068 |
| 1.643052957827417 | 2.7 | 5.399 | 8.099 |
| 1.646194550481007 | 2.71 | 5.42 | 8.13 |
| 1.649336143134597 | 2.72 | 5.441 | 8.161 |
| 1.652477735788187 | 2.731 | 5.461 | 8.192 |
| 1.655619328441777 | 2.741 | 5.482 | 8.223 |
| 1.658760921095366 | 2.751 | 5.503 | 8.254 |
| 1.661902513748956 | 2.762 | 5.524 | 8.286 |
| 1.665044106402546 | 2.772 | 5.545 | 8.317 |
| 1.668185699056136 | 2.783 | 5.566 | 8.349 |
| 1.671327291709726 | 2.793 | 5.587 | 8.38 |
| 1.674468884363315 | 2.804 | 5.608 | 8.412 |
| 1.677610477016905 | 2.814 | 5.629 | 8.443 |
| 1.680752069670495 | 2.825 | 5.65 | 8.475 |
| 1.683893662324085 | 2.835 | 5.671 | 8.506 |
| 1.687035254977675 | 2.846 | 5.692 | 8.538 |
| 1.690176847631265 | 2.857 | 5.713 | 8.57 |
| 1.693318440284854 | 2.867 | 5.735 | 8.602 |
| 1.696460032938444 | 2.878 | 5.756 | 8.634 |
| 1.699601625592034 | 2.889 | 5.777 | 8.666 |
| 1.702743218245624 | 2.899 | 5.799 | 8.698 |
| 1.705884810899214 | 2.91 | 5.82 | 8.73 |
| 1.709026403552803 | 2.921 | 5.842 | 8.762 |
| 1.712167996206393 | 2.932 | 5.863 | 8.795 |
| 1.715309588859983 | 2.942 | 5.885 | 8.827 |
| 1.718451181513573 | 2.953 | 5.906 | 8.859 |
| 1.721592774167163 | 2.964 | 5.928 | 8.892 |
| 1.724734366820753 | 2.975 | 5.949 | 8.924 |
| 1.727875959474342 | 2.986 | 5.971 | 8.957 |
| 1.731017552127932 | 2.996 | 5.993 | 8.989 |
| 1.734159144781522 | 3.007 | 6.015 | 9.022 |
| 1.737300737435112 | 3.018 | 6.036 | 9.055 |
| 1.740442330088702 | 3.029 | 6.058 | 9.087 |
| 1.743583922742291 | 3.04 | 6.08 | 9.12 |
| 1.746725515395881 | 3.051 | 6.102 | 9.153 |
| 1.749867108049471 | 3.062 | 6.124 | 9.186 |
| 1.753008700703061 | 3.073 | 6.146 | 9.219 |
| 1.756150293356651 | 3.084 | 6.168 | 9.252 |
| 1.759291886010241 | 3.095 | 6.19 | 9.285 |
| 1.76243347866383 | 3.106 | 6.212 | 9.319 |
| 1.76557507131742 | 3.117 | 6.235 | 9.352 |
| 1.76871666397101 | 3.128 | 6.257 | 9.385 |
| 1.7718582566246 | 3.139 | 6.279 | 9.418 |
| 1.77499984927819 | 3.151 | 6.301 | 9.452 |
| 1.77814144193178 | 3.162 | 6.324 | 9.485 |
| 1.78128303458537 | 3.173 | 6.346 | 9.519 |
| 1.784424627238959 | 3.184 | 6.368 | 9.553 |
| 1.787566219892549 | 3.195 | 6.391 | 9.586 |
| 1.790707812546139 | 3.207 | 6.413 | 9.62 |
| 1.793849405199729 | 3.218 | 6.436 | 9.654 |
| 1.796990997853318 | 3.229 | 6.458 | 9.688 |
| 1.800132590506908 | 3.24 | 6.481 | 9.721 |
| 1.803274183160498 | 3.252 | 6.504 | 9.755 |
| 1.806415775814088 | 3.263 | 6.526 | 9.789 |
| 1.809557368467678 | 3.274 | 6.549 | 9.823 |
| 1.812698961121268 | 3.286 | 6.572 | 9.858 |
| 1.815840553774857 | 3.297 | 6.595 | 9.892 |
| 1.818982146428447 | 3.309 | 6.617 | 9.926 |
| 1.822123739082037 | 3.32 | 6.64 | 9.96 |
| 1.825265331735627 | 3.332 | 6.663 | 9.995 |
| 1.828406924389217 | 3.343 | 6.686 | 10.029 |
| 1.831548517042806 | 3.355 | 6.709 | 10.064 |
| 1.834690109696396 | 3.366 | 6.732 | 10.098 |
| 1.837831702349986 | 3.378 | 6.755 | 10.133 |
| 1.840973295003576 | 3.389 | 6.778 | 10.168 |
| 1.844114887657166 | 3.401 | 6.802 | 10.202 |
| 1.847256480310756 | 3.412 | 6.825 | 10.237 |
| 1.850398072964345 | 3.424 | 6.848 | 10.272 |
| 1.853539665617935 | 3.436 | 6.871 | 10.307 |
| 1.856681258271525 | 3.447 | 6.895 | 10.342 |
| 1.859822850925115 | 3.459 | 6.918 | 10.377 |
| 1.862964443578705 | 3.471 | 6.941 | 10.412 |
| 1.866106036232294 | 3.482 | 6.965 | 10.447 |
| 1.869247628885884 | 3.494 | 6.988 | 10.482 |
| 1.872389221539474 | 3.506 | 7.012 | 10.518 |
| 1.875530814193064 | 3.518 | 7.035 | 10.553 |
| 1.878672406846654 | 3.529 | 7.059 | 10.588 |
| 1.881813999500244 | 3.541 | 7.082 | 10.624 |
| 1.884955592153833 | 3.553 | 7.106 | 10.659 |
| 1.888097184807423 | 3.565 | 7.13 | 10.695 |
| 1.891238777461013 | 3.577 | 7.154 | 10.73 |
| 1.894380370114603 | 3.589 | 7.177 | 10.766 |
| 1.897521962768193 | 3.601 | 7.201 | 10.802 |
| 1.900663555421783 | 3.613 | 7.225 | 10.838 |
| 1.903805148075372 | 3.624 | 7.249 | 10.873 |
| 1.906946740728962 | 3.636 | 7.273 | 10.909 |
| 1.910088333382552 | 3.648 | 7.297 | 10.945 |
| 1.913229926036142 | 3.66 | 7.321 | 10.981 |
| 1.916371518689732 | 3.672 | 7.345 | 11.017 |
| 1.919513111343321 | 3.685 | 7.369 | 11.054 |
| 1.922654703996911 | 3.697 | 7.393 | 11.09 |
| 1.925796296650501 | 3.709 | 7.417 | 11.126 |
| 1.928937889304091 | 3.721 | 7.442 | 11.162 |
| 1.932079481957681 | 3.733 | 7.466 | 11.199 |
| 1.935221074611271 | 3.745 | 7.49 | 11.235 |
| 1.93836266726486 | 3.757 | 7.514 | 11.272 |
| 1.94150425991845 | 3.769 | 7.539 | 11.308 |
| 1.94464585257204 | 3.782 | 7.563 | 11.345 |
| 1.94778744522563 | 3.794 | 7.588 | 11.382 |
| 1.95092903787922 | 3.806 | 7.612 | 11.418 |
| 1.954070630532809 | 3.818 | 7.637 | 11.455 |
| 1.957212223186399 | 3.831 | 7.661 | 11.492 |
| 1.960353815839989 | 3.843 | 7.686 | 11.529 |
| 1.963495408493579 | 3.855 | 7.711 | 11.566 |
| 1.966637001147169 | 3.868 | 7.735 | 11.603 |
| 1.969778593800759 | 3.88 | 7.76 | 11.64 |
| 1.972920186454348 | 3.892 | 7.785 | 11.677 |
| 1.976061779107938 | 3.905 | 7.81 | 11.714 |
| 1.979203371761528 | 3.917 | 7.834 | 11.752 |
| 1.982344964415118 | 3.93 | 7.859 | 11.789 |
| 1.985486557068708 | 3.942 | 7.884 | 11.826 |
| 1.988628149722297 | 3.955 | 7.909 | 11.864 |
| 1.991769742375887 | 3.967 | 7.934 | 11.901 |
| 1.994911335029477 | 3.98 | 7.959 | 11.939 |
| 1.998052927683067 | 3.992 | 7.984 | 11.977 |
| 2.001194520336656 | 4.005 | 8.01 | 12.014 |
| 2.004336112990246 | 4.017 | 8.035 | 12.052 |
| 2.007477705643836 | 4.03 | 8.06 | 12.09 |
| 2.010619298297426 | 4.043 | 8.085 | 12.128 |
| 2.013760890951015 | 4.055 | 8.11 | 12.166 |
| 2.016902483604605 | 4.068 | 8.136 | 12.204 |
| 2.020044076258194 | 4.081 | 8.161 | 12.242 |
| 2.023185668911784 | 4.093 | 8.187 | 12.28 |
| 2.026327261565373 | 4.106 | 8.212 | 12.318 |
| 2.029468854218963 | 4.119 | 8.237 | 12.356 |
| 2.032610446872553 | 4.132 | 8.263 | 12.395 |
| 2.035752039526142 | 4.144 | 8.289 | 12.433 |
| 2.038893632179732 | 4.157 | 8.314 | 12.471 |
| 2.042035224833322 | 4.17 | 8.34 | 12.51 |
| 2.045176817486911 | 4.183 | 8.365 | 12.548 |
| 2.048318410140501 | 4.196 | 8.391 | 12.587 |
| 2.05146000279409 | 4.208 | 8.417 | 12.625 |
| 2.05460159544768 | 4.221 | 8.443 | 12.664 |
| 2.05774318810127 | 4.234 | 8.469 | 12.703 |
| 2.06088478075486 | 4.247 | 8.494 | 12.742 |
| 2.064026373408449 | 4.26 | 8.52 | 12.781 |
| 2.067167966062038 | 4.273 | 8.546 | 12.82 |
| 2.070309558715628 | 4.286 | 8.572 | 12.859 |
| 2.073451151369218 | 4.299 | 8.598 | 12.898 |
| 2.076592744022807 | 4.312 | 8.624 | 12.937 |
| 2.079734336676396 | 4.325 | 8.651 | 12.976 |
| 2.082875929329986 | 4.338 | 8.677 | 13.015 |
| 2.086017521983576 | 4.351 | 8.703 | 13.054 |
| 2.089159114637166 | 4.365 | 8.729 | 13.094 |
| 2.092300707290755 | 4.378 | 8.755 | 13.133 |
| 2.095442299944345 | 4.391 | 8.782 | 13.173 |
| 2.098583892597934 | 4.404 | 8.808 | 13.212 |
| 2.101725485251524 | 4.417 | 8.835 | 13.252 |
| 2.104867077905113 | 4.43 | 8.861 | 13.291 |
| 2.108008670558703 | 4.444 | 8.887 | 13.331 |
| 2.111150263212293 | 4.457 | 8.914 | 13.371 |
| 2.114291855865882 | 4.47 | 8.94 | 13.411 |
| 2.117433448519472 | 4.484 | 8.967 | 13.451 |
| 2.120575041173061 | 4.497 | 8.994 | 13.491 |
| 2.123716633826651 | 4.51 | 9.02 | 13.531 |
| 2.126858226480241 | 4.524 | 9.047 | 13.571 |
| 2.12999981913383 | 4.537 | 9.074 | 13.611 |
| 2.13314141178742 | 4.55 | 9.101 | 13.651 |
| 2.136283004441009 | 4.564 | 9.127 | 13.691 |
| 2.1394245970946 | 4.577 | 9.154 | 13.731 |
| 2.142566189748189 | 4.591 | 9.181 | 13.772 |
| 2.145707782401778 | 4.604 | 9.208 | 13.812 |
| 2.148849375055368 | 4.618 | 9.235 | 13.853 |
| 2.151990967708957 | 4.631 | 9.262 | 13.893 |
| 2.155132560362547 | 4.645 | 9.289 | 13.934 |
| 2.158274153016137 | 4.658 | 9.316 | 13.974 |
| 2.161415745669726 | 4.672 | 9.343 | 14.015 |
| 2.164557338323316 | 4.685 | 9.371 | 14.056 |
| 2.167698930976905 | 4.699 | 9.398 | 14.097 |
| 2.170840523630495 | 4.713 | 9.425 | 14.138 |
| 2.173982116284085 | 4.726 | 9.452 | 14.179 |
| 2.177123708937674 | 4.74 | 9.48 | 14.22 |
| 2.180265301591264 | 4.754 | 9.507 | 14.261 |
| 2.183406894244853 | 4.767 | 9.535 | 14.302 |
| 2.186548486898443 | 4.781 | 9.562 | 14.343 |
| 2.189690079552032 | 4.795 | 9.589 | 14.384 |
| 2.192831672205622 | 4.809 | 9.617 | 14.426 |
| 2.195973264859212 | 4.822 | 9.645 | 14.467 |
| 2.199114857512801 | 4.836 | 9.672 | 14.508 |
| 2.202256450166391 | 4.85 | 9.7 | 14.55 |
| 2.20539804281998 | 4.864 | 9.728 | 14.591 |
| 2.20853963547357 | 4.878 | 9.755 | 14.633 |
| 2.21168122812716 | 4.892 | 9.783 | 14.675 |
| 2.214822820780749 | 4.905 | 9.811 | 14.716 |
| 2.21796441343434 | 4.919 | 9.839 | 14.758 |
| 2.221106006087928 | 4.933 | 9.867 | 14.8 |
| 2.224247598741518 | 4.947 | 9.895 | 14.842 |
| 2.227389191395108 | 4.961 | 9.923 | 14.884 |
| 2.230530784048697 | 4.975 | 9.951 | 14.926 |
| 2.233672376702287 | 4.989 | 9.979 | 14.968 |
| 2.236813969355877 | 5.003 | 10.007 | 15.01 |
| 2.239955562009466 | 5.017 | 10.035 | 15.052 |
| 2.243097154663056 | 5.031 | 10.063 | 15.094 |
| 2.246238747316645 | 5.046 | 10.091 | 15.137 |
| 2.249380339970235 | 5.06 | 10.119 | 15.179 |
| 2.252521932623825 | 5.074 | 10.148 | 15.222 |
| 2.255663525277414 | 5.088 | 10.176 | 15.264 |
| 2.258805117931004 | 5.102 | 10.204 | 15.307 |
| 2.261946710584593 | 5.116 | 10.233 | 15.349 |
| 2.265088303238183 | 5.131 | 10.261 | 15.392 |
| 2.268229895891772 | 5.145 | 10.29 | 15.435 |
| 2.271371488545362 | 5.159 | 10.318 | 15.477 |
| 2.274513081198952 | 5.173 | 10.347 | 15.52 |
| 2.277654673852541 | 5.188 | 10.375 | 15.563 |
| 2.28079626650613 | 5.202 | 10.404 | 15.606 |
| 2.28393785915972 | 5.216 | 10.433 | 15.649 |
| 2.28707945181331 | 5.231 | 10.461 | 15.692 |
| 2.2902210444669 | 5.245 | 10.49 | 15.735 |
| 2.293362637120489 | 5.26 | 10.519 | 15.779 |
| 2.296504229774079 | 5.274 | 10.548 | 15.822 |
| 2.299645822427669 | 5.288 | 10.577 | 15.865 |
| 2.302787415081258 | 5.303 | 10.606 | 15.908 |
| 2.305929007734848 | 5.317 | 10.635 | 15.952 |
| 2.309070600388437 | 5.332 | 10.664 | 15.995 |
| 2.312212193042027 | 5.346 | 10.693 | 16.039 |
| 2.315353785695617 | 5.361 | 10.722 | 16.083 |
| 2.318495378349206 | 5.375 | 10.751 | 16.126 |
| 2.321636971002796 | 5.39 | 10.78 | 16.17 |
| 2.324778563656385 | 5.405 | 10.809 | 16.214 |
| 2.327920156309975 | 5.419 | 10.838 | 16.258 |
| 2.331061748963565 | 5.434 | 10.868 | 16.302 |
| 2.334203341617154 | 5.449 | 10.897 | 16.346 |
| 2.337344934270744 | 5.463 | 10.926 | 16.39 |
| 2.340486526924333 | 5.478 | 10.956 | 16.434 |
| 2.343628119577923 | 5.493 | 10.985 | 16.478 |
| 2.346769712231512 | 5.507 | 11.015 | 16.522 |
| 2.349911304885102 | 5.522 | 11.044 | 16.566 |
| 2.353052897538692 | 5.537 | 11.074 | 16.611 |
| 2.356194490192281 | 5.552 | 11.103 | 16.655 |
| 2.359336082845871 | 5.566 | 11.133 | 16.699 |
| 2.36247767549946 | 5.581 | 11.163 | 16.744 |
| 2.36561926815305 | 5.596 | 11.192 | 16.788 |
| 2.36876086080664 | 5.611 | 11.222 | 16.833 |
| 2.371902453460229 | 5.626 | 11.252 | 16.878 |
| 2.375044046113819 | 5.641 | 11.282 | 16.923 |
| 2.378185638767408 | 5.656 | 11.312 | 16.967 |
| 2.381327231420998 | 5.671 | 11.341 | 17.012 |
| 2.384468824074588 | 5.686 | 11.371 | 17.057 |
| 2.387610416728177 | 5.701 | 11.401 | 17.102 |
| 2.390752009381767 | 5.716 | 11.431 | 17.147 |
| 2.393893602035356 | 5.731 | 11.461 | 17.192 |
| 2.397035194688946 | 5.746 | 11.492 | 17.237 |
| 2.400176787342535 | 5.761 | 11.522 | 17.283 |
| 2.403318379996125 | 5.776 | 11.552 | 17.328 |
| 2.406459972649715 | 5.791 | 11.582 | 17.373 |
| 2.409601565303304 | 5.806 | 11.612 | 17.419 |
| 2.412743157956894 | 5.821 | 11.643 | 17.464 |
| 2.415884750610484 | 5.836 | 11.673 | 17.509 |
| 2.419026343264073 | 5.852 | 11.703 | 17.555 |
| 2.422167935917663 | 5.867 | 11.734 | 17.601 |
| 2.425309528571252 | 5.882 | 11.764 | 17.646 |
| 2.428451121224842 | 5.897 | 11.795 | 17.692 |
| 2.431592713878432 | 5.913 | 11.825 | 17.738 |
| 2.434734306532021 | 5.928 | 11.856 | 17.784 |
| 2.437875899185611 | 5.943 | 11.886 | 17.83 |
| 2.4410174918392 | 5.959 | 11.917 | 17.876 |
| 2.44415908449279 | 5.974 | 11.948 | 17.922 |
| 2.44730067714638 | 5.989 | 11.979 | 17.968 |
| 2.450442269799969 | 6.005 | 12.009 | 18.014 |
| 2.453583862453559 | 6.02 | 12.04 | 18.06 |
| 2.456725455107148 | 6.035 | 12.071 | 18.106 |
| 2.459867047760738 | 6.051 | 12.102 | 18.153 |
| 2.463008640414328 | 6.066 | 12.133 | 18.199 |
| 2.466150233067917 | 6.082 | 12.164 | 18.246 |
| 2.469291825721507 | 6.097 | 12.195 | 18.292 |
| 2.472433418375096 | 6.113 | 12.226 | 18.339 |
| 2.475575011028686 | 6.128 | 12.257 | 18.385 |
| 2.478716603682276 | 6.144 | 12.288 | 18.432 |
| 2.481858196335865 | 6.16 | 12.319 | 18.479 |
| 2.484999788989454 | 6.175 | 12.35 | 18.526 |
| 2.488141381643044 | 6.191 | 12.382 | 18.573 |
| 2.491282974296634 | 6.206 | 12.413 | 18.619 |
| 2.494424566950224 | 6.222 | 12.444 | 18.666 |
| 2.497566159603813 | 6.238 | 12.476 | 18.714 |
| 2.500707752257402 | 6.254 | 12.507 | 18.761 |
| 2.503849344910992 | 6.269 | 12.539 | 18.808 |
| 2.506990937564582 | 6.285 | 12.57 | 18.855 |
| 2.510132530218172 | 6.301 | 12.602 | 18.902 |
| 2.513274122871761 | 6.317 | 12.633 | 18.95 |
| 2.516415715525351 | 6.332 | 12.665 | 18.997 |
| 2.51955730817894 | 6.348 | 12.696 | 19.045 |
| 2.52269890083253 | 6.364 | 12.728 | 19.092 |
| 2.52584049348612 | 6.38 | 12.76 | 19.14 |
| 2.528982086139709 | 6.396 | 12.792 | 19.187 |
| 2.532123678793299 | 6.412 | 12.823 | 19.235 |
| 2.535265271446888 | 6.428 | 12.855 | 19.283 |
| 2.538406864100478 | 6.444 | 12.887 | 19.331 |
| 2.541548456754068 | 6.459 | 12.919 | 19.378 |
| 2.544690049407657 | 6.475 | 12.951 | 19.426 |
| 2.547831642061246 | 6.491 | 12.983 | 19.474 |
| 2.550973234714836 | 6.507 | 13.015 | 19.522 |
| 2.554114827368426 | 6.524 | 13.047 | 19.571 |
| 2.557256420022016 | 6.54 | 13.079 | 19.619 |
| 2.560398012675605 | 6.556 | 13.111 | 19.667 |
| 2.563539605329195 | 6.572 | 13.143 | 19.715 |
| 2.566681197982784 | 6.588 | 13.176 | 19.764 |
| 2.569822790636374 | 6.604 | 13.208 | 19.812 |
| 2.572964383289964 | 6.62 | 13.24 | 19.86 |
| 2.576105975943553 | 6.636 | 13.273 | 19.909 |
| 2.579247568597143 | 6.653 | 13.305 | 19.958 |
| 2.582389161250732 | 6.669 | 13.337 | 20.006 |
| 2.585530753904322 | 6.685 | 13.37 | 20.055 |
| 2.588672346557911 | 6.701 | 13.402 | 20.104 |
| 2.591813939211501 | 6.717 | 13.435 | 20.152 |
| 2.594955531865091 | 6.734 | 13.468 | 20.201 |
| 2.59809712451868 | 6.75 | 13.5 | 20.25 |
| 2.60123871717227 | 6.766 | 13.533 | 20.299 |
| 2.604380309825859 | 6.783 | 13.566 | 20.348 |
| 2.60752190247945 | 6.799 | 13.598 | 20.398 |
| 2.610663495133039 | 6.816 | 13.631 | 20.447 |
| 2.613805087786628 | 6.832 | 13.664 | 20.496 |
| 2.616946680440218 | 6.848 | 13.697 | 20.545 |
| 2.620088273093807 | 6.865 | 13.73 | 20.595 |
| 2.623229865747397 | 6.881 | 13.763 | 20.644 |
| 2.626371458400986 | 6.898 | 13.796 | 20.693 |
| 2.629513051054576 | 6.914 | 13.829 | 20.743 |
| 2.632654643708166 | 6.931 | 13.862 | 20.793 |
| 2.635796236361755 | 6.947 | 13.895 | 20.842 |
| 2.638937829015345 | 6.964 | 13.928 | 20.892 |
| 2.642079421668935 | 6.981 | 13.961 | 20.942 |
| 2.645221014322524 | 6.997 | 13.994 | 20.992 |
| 2.648362606976114 | 7.014 | 14.028 | 21.041 |
| 2.651504199629703 | 7.03 | 14.061 | 21.091 |
| 2.654645792283293 | 7.047 | 14.094 | 21.141 |
| 2.657787384936883 | 7.064 | 14.128 | 21.192 |
| 2.660928977590472 | 7.081 | 14.161 | 21.242 |
| 2.664070570244062 | 7.097 | 14.195 | 21.292 |
| 2.667212162897651 | 7.114 | 14.228 | 21.342 |
| 2.670353755551241 | 7.131 | 14.262 | 21.392 |
| 2.673495348204831 | 7.148 | 14.295 | 21.443 |
| 2.67663694085842 | 7.164 | 14.329 | 21.493 |
| 2.67977853351201 | 7.181 | 14.362 | 21.544 |
| 2.682920126165599 | 7.198 | 14.396 | 21.594 |
| 2.686061718819189 | 7.215 | 14.43 | 21.645 |
| 2.689203311472779 | 7.232 | 14.464 | 21.695 |
| 2.692344904126368 | 7.249 | 14.497 | 21.746 |
| 2.695486496779958 | 7.266 | 14.531 | 21.797 |
| 2.698628089433547 | 7.283 | 14.565 | 21.848 |
| 2.701769682087137 | 7.3 | 14.599 | 21.899 |
| 2.704911274740726 | 7.317 | 14.633 | 21.95 |
| 2.708052867394316 | 7.334 | 14.667 | 22.001 |
| 2.711194460047906 | 7.351 | 14.701 | 22.052 |
| 2.714336052701495 | 7.368 | 14.735 | 22.103 |
| 2.717477645355085 | 7.385 | 14.769 | 22.154 |
| 2.720619238008675 | 7.402 | 14.804 | 22.205 |
| 2.723760830662264 | 7.419 | 14.838 | 22.257 |
| 2.726902423315854 | 7.436 | 14.872 | 22.308 |
| 2.730044015969443 | 7.453 | 14.906 | 22.359 |
| 2.733185608623033 | 7.47 | 14.941 | 22.411 |
| 2.736327201276622 | 7.487 | 14.975 | 22.462 |
| 2.739468793930212 | 7.505 | 15.009 | 22.514 |
| 2.742610386583802 | 7.522 | 15.044 | 22.566 |
| 2.745751979237391 | 7.539 | 15.078 | 22.617 |
| 2.748893571890981 | 7.556 | 15.113 | 22.669 |
| 2.752035164544571 | 7.574 | 15.147 | 22.721 |
| 2.75517675719816 | 7.591 | 15.182 | 22.773 |
| 2.75831834985175 | 7.608 | 15.217 | 22.825 |
| 2.76145994250534 | 7.626 | 15.251 | 22.877 |
| 2.764601535158929 | 7.643 | 15.286 | 22.929 |
| 2.767743127812518 | 7.66 | 15.321 | 22.981 |
| 2.770884720466108 | 7.678 | 15.356 | 23.033 |
| 2.774026313119698 | 7.695 | 15.39 | 23.086 |
| 2.777167905773287 | 7.713 | 15.425 | 23.138 |
| 2.780309498426877 | 7.73 | 15.46 | 23.19 |
| 2.783451091080466 | 7.748 | 15.495 | 23.243 |
| 2.786592683734056 | 7.765 | 15.53 | 23.295 |
| 2.789734276387645 | 7.783 | 15.565 | 23.348 |
| 2.792875869041235 | 7.8 | 15.6 | 23.4 |
| 2.796017461694825 | 7.818 | 15.635 | 23.453 |
| 2.799159054348415 | 7.835 | 15.671 | 23.506 |
| 2.802300647002004 | 7.853 | 15.706 | 23.559 |
| 2.805442239655594 | 7.871 | 15.741 | 23.612 |
| 2.808583832309183 | 7.888 | 15.776 | 23.664 |
| 2.811725424962773 | 7.906 | 15.812 | 23.717 |
| 2.814867017616363 | 7.923 | 15.847 | 23.77 |
| 2.818008610269952 | 7.941 | 15.882 | 23.824 |
| 2.821150202923542 | 7.959 | 15.918 | 23.877 |
| 2.824291795577131 | 7.977 | 15.953 | 23.93 |
| 2.827433388230721 | 7.994 | 15.989 | 23.983 |
| 2.830574980884311 | 8.012 | 16.024 | 24.036 |
| 2.8337165735379 | 8.03 | 16.06 | 24.09 |
| 2.83685816619149 | 8.048 | 16.096 | 24.143 |
| 2.83999975884508 | 8.066 | 16.131 | 24.197 |
| 2.843141351498669 | 8.083 | 16.167 | 24.25 |
| 2.846282944152259 | 8.101 | 16.203 | 24.304 |
| 2.849424536805848 | 8.119 | 16.238 | 24.358 |
| 2.852566129459438 | 8.137 | 16.274 | 24.411 |
| 2.855707722113027 | 8.155 | 16.31 | 24.465 |
| 2.858849314766617 | 8.173 | 16.346 | 24.519 |
| 2.861990907420207 | 8.191 | 16.382 | 24.573 |
| 2.865132500073796 | 8.209 | 16.418 | 24.627 |
| 2.868274092727386 | 8.227 | 16.454 | 24.681 |
| 2.871415685380975 | 8.245 | 16.49 | 24.735 |
| 2.874557278034565 | 8.263 | 16.526 | 24.789 |
| 2.877698870688155 | 8.281 | 16.562 | 24.843 |
| 2.880840463341744 | 8.299 | 16.598 | 24.898 |
| 2.883982055995333 | 8.317 | 16.635 | 24.952 |
| 2.887123648648923 | 8.335 | 16.671 | 25.006 |
| 2.890265241302513 | 8.354 | 16.707 | 25.061 |
| 2.893406833956102 | 8.372 | 16.744 | 25.115 |
| 2.896548426609692 | 8.39 | 16.78 | 25.17 |
| 2.899690019263282 | 8.408 | 16.816 | 25.225 |
| 2.902831611916871 | 8.426 | 16.853 | 25.279 |
| 2.905973204570461 | 8.445 | 16.889 | 25.334 |
| 2.90911479722405 | 8.463 | 16.926 | 25.389 |
| 2.91225638987764 | 8.481 | 16.962 | 25.444 |
| 2.91539798253123 | 8.5 | 16.999 | 25.499 |
| 2.918539575184819 | 8.518 | 17.036 | 25.554 |
| 2.921681167838409 | 8.536 | 17.072 | 25.609 |
| 2.924822760491998 | 8.555 | 17.109 | 25.664 |
| 2.927964353145588 | 8.573 | 17.146 | 25.719 |
| 2.931105945799178 | 8.591 | 17.183 | 25.774 |
| 2.934247538452767 | 8.61 | 17.22 | 25.829 |
| 2.937389131106357 | 8.628 | 17.257 | 25.885 |
| 2.940530723759946 | 8.647 | 17.293 | 25.94 |
| 2.943672316413536 | 8.665 | 17.33 | 25.996 |
| 2.946813909067126 | 8.684 | 17.367 | 26.051 |
| 2.949955501720715 | 8.702 | 17.404 | 26.107 |
| 2.953097094374305 | 8.721 | 17.442 | 26.162 |
| 2.956238687027894 | 8.739 | 17.479 | 26.218 |
| 2.959380279681484 | 8.758 | 17.516 | 26.274 |
| 2.962521872335073 | 8.777 | 17.553 | 26.33 |
| 2.965663464988663 | 8.795 | 17.59 | 26.385 |
| 2.968805057642253 | 8.814 | 17.628 | 26.441 |
| 2.971946650295842 | 8.832 | 17.665 | 26.497 |
| 2.975088242949432 | 8.851 | 17.702 | 26.553 |
| 2.978229835603022 | 8.87 | 17.74 | 26.61 |
| 2.981371428256611 | 8.889 | 17.777 | 26.666 |
| 2.984513020910201 | 8.907 | 17.815 | 26.722 |
| 2.98765461356379 | 8.926 | 17.852 | 26.778 |
| 2.99079620621738 | 8.945 | 17.89 | 26.835 |
| 2.99393779887097 | 8.964 | 17.927 | 26.891 |
| 2.997079391524559 | 8.982 | 17.965 | 26.947 |
| 3.000220984178149 | 9.001 | 18.003 | 27.004 |
| 3.003362576831738 | 9.02 | 18.04 | 27.061 |
| 3.006504169485328 | 9.039 | 18.078 | 27.117 |
| 3.009645762138918 | 9.058 | 18.116 | 27.174 |
| 3.012787354792507 | 9.077 | 18.154 | 27.231 |
| 3.015928947446097 | 9.096 | 18.192 | 27.287 |
| 3.019070540099686 | 9.115 | 18.23 | 27.344 |
| 3.022212132753276 | 9.134 | 18.268 | 27.401 |
| 3.025353725406866 | 9.153 | 18.306 | 27.458 |
| 3.028495318060455 | 9.172 | 18.344 | 27.515 |
| 3.031636910714045 | 9.191 | 18.382 | 27.572 |
| 3.034778503367634 | 9.21 | 18.42 | 27.63 |
| 3.037920096021224 | 9.229 | 18.458 | 27.687 |
| 3.041061688674814 | 9.248 | 18.496 | 27.744 |
| 3.044203281328403 | 9.267 | 18.534 | 27.802 |
| 3.047344873981992 | 9.286 | 18.573 | 27.859 |
| 3.050486466635582 | 9.305 | 18.611 | 27.916 |
| 3.053628059289172 | 9.325 | 18.649 | 27.974 |
| 3.056769651942762 | 9.344 | 18.688 | 28.032 |
| 3.059911244596351 | 9.363 | 18.726 | 28.089 |
| 3.063052837249941 | 9.382 | 18.765 | 28.147 |
| 3.06619442990353 | 9.402 | 18.803 | 28.205 |
| 3.06933602255712 | 9.421 | 18.842 | 28.262 |
| 3.07247761521071 | 9.44 | 18.88 | 28.32 |
| 3.075619207864299 | 9.459 | 18.919 | 28.378 |
| 3.078760800517889 | 9.479 | 18.958 | 28.436 |
| 3.081902393171478 | 9.498 | 18.996 | 28.494 |
| 3.085043985825068 | 9.517 | 19.035 | 28.552 |
| 3.088185578478657 | 9.537 | 19.074 | 28.611 |
| 3.091327171132247 | 9.556 | 19.113 | 28.669 |
| 3.094468763785837 | 9.576 | 19.151 | 28.727 |
| 3.097610356439426 | 9.595 | 19.19 | 28.786 |
| 3.100751949093016 | 9.615 | 19.229 | 28.844 |
| 3.103893541746605 | 9.634 | 19.268 | 28.902 |
| 3.107035134400195 | 9.654 | 19.307 | 28.961 |
| 3.110176727053785 | 9.673 | 19.346 | 29.02 |
| 3.113318319707374 | 9.693 | 19.386 | 29.078 |
| 3.116459912360964 | 9.712 | 19.425 | 29.137 |
| 3.119601505014554 | 9.732 | 19.464 | 29.196 |
| 3.122743097668143 | 9.752 | 19.503 | 29.255 |
| 3.125884690321733 | 9.771 | 19.542 | 29.313 |
| 3.129026282975322 | 9.791 | 19.582 | 29.372 |
| 3.132167875628912 | 9.81 | 19.621 | 29.431 |
| 3.135309468282502 | 9.83 | 19.66 | 29.49 |
| 3.138451060936091 | 9.85 | 19.7 | 29.55 |
| 3.141592653589681 | 9.87 | 19.739 | 29.609 |